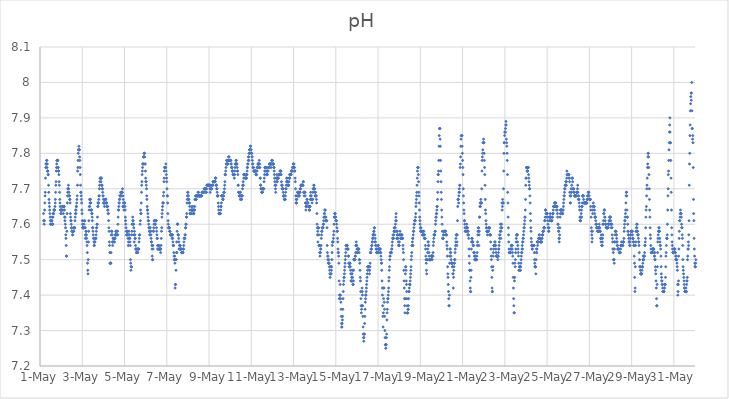
| Category | pH |
|---|---|
| 44682.166666666664 | 7.63 |
| 44682.177083333336 | 7.61 |
| 44682.1875 | 7.61 |
| 44682.197916666664 | 7.6 |
| 44682.208333333336 | 7.61 |
| 44682.21875 | 7.64 |
| 44682.229166666664 | 7.66 |
| 44682.239583333336 | 7.68 |
| 44682.25 | 7.69 |
| 44682.260416666664 | 7.73 |
| 44682.270833333336 | 7.76 |
| 44682.28125 | 7.77 |
| 44682.291666666664 | 7.77 |
| 44682.302083333336 | 7.77 |
| 44682.3125 | 7.78 |
| 44682.322916666664 | 7.78 |
| 44682.333333333336 | 7.76 |
| 44682.34375 | 7.77 |
| 44682.354166666664 | 7.75 |
| 44682.364583333336 | 7.75 |
| 44682.375 | 7.75 |
| 44682.385416666664 | 7.74 |
| 44682.395833333336 | 7.74 |
| 44682.40625 | 7.71 |
| 44682.416666666664 | 7.69 |
| 44682.427083333336 | 7.67 |
| 44682.4375 | 7.66 |
| 44682.447916666664 | 7.65 |
| 44682.458333333336 | 7.64 |
| 44682.46875 | 7.63 |
| 44682.479166666664 | 7.62 |
| 44682.489583333336 | 7.61 |
| 44682.5 | 7.6 |
| 44682.510416666664 | 7.6 |
| 44682.520833333336 | 7.6 |
| 44682.53125 | 7.61 |
| 44682.541666666664 | 7.61 |
| 44682.552083333336 | 7.61 |
| 44682.5625 | 7.61 |
| 44682.572916666664 | 7.62 |
| 44682.583333333336 | 7.6 |
| 44682.59375 | 7.6 |
| 44682.604166666664 | 7.6 |
| 44682.614583333336 | 7.62 |
| 44682.625 | 7.63 |
| 44682.635416666664 | 7.63 |
| 44682.645833333336 | 7.63 |
| 44682.65625 | 7.64 |
| 44682.666666666664 | 7.64 |
| 44682.677083333336 | 7.64 |
| 44682.6875 | 7.64 |
| 44682.697916666664 | 7.64 |
| 44682.708333333336 | 7.65 |
| 44682.71875 | 7.66 |
| 44682.729166666664 | 7.67 |
| 44682.739583333336 | 7.69 |
| 44682.75 | 7.71 |
| 44682.760416666664 | 7.72 |
| 44682.770833333336 | 7.75 |
| 44682.78125 | 7.76 |
| 44682.791666666664 | 7.77 |
| 44682.802083333336 | 7.78 |
| 44682.8125 | 7.78 |
| 44682.822916666664 | 7.78 |
| 44682.833333333336 | 7.78 |
| 44682.84375 | 7.78 |
| 44682.854166666664 | 7.76 |
| 44682.864583333336 | 7.76 |
| 44682.875 | 7.75 |
| 44682.885416666664 | 7.75 |
| 44682.895833333336 | 7.74 |
| 44682.90625 | 7.72 |
| 44682.916666666664 | 7.71 |
| 44682.927083333336 | 7.69 |
| 44682.9375 | 7.67 |
| 44682.947916666664 | 7.66 |
| 44682.958333333336 | 7.65 |
| 44682.96875 | 7.64 |
| 44682.979166666664 | 7.64 |
| 44682.989583333336 | 7.63 |
| 44683.0 | 7.63 |
| 44683.010416666664 | 7.64 |
| 44683.020833333336 | 7.64 |
| 44683.03125 | 7.64 |
| 44683.041666666664 | 7.64 |
| 44683.052083333336 | 7.65 |
| 44683.0625 | 7.65 |
| 44683.072916666664 | 7.65 |
| 44683.083333333336 | 7.65 |
| 44683.09375 | 7.64 |
| 44683.104166666664 | 7.63 |
| 44683.114583333336 | 7.65 |
| 44683.125 | 7.65 |
| 44683.135416666664 | 7.65 |
| 44683.145833333336 | 7.65 |
| 44683.15625 | 7.64 |
| 44683.166666666664 | 7.62 |
| 44683.177083333336 | 7.61 |
| 44683.1875 | 7.62 |
| 44683.197916666664 | 7.6 |
| 44683.208333333336 | 7.59 |
| 44683.21875 | 7.57 |
| 44683.229166666664 | 7.56 |
| 44683.239583333336 | 7.54 |
| 44683.25 | 7.51 |
| 44683.260416666664 | 7.51 |
| 44683.270833333336 | 7.58 |
| 44683.28125 | 7.63 |
| 44683.291666666664 | 7.66 |
| 44683.302083333336 | 7.68 |
| 44683.3125 | 7.69 |
| 44683.322916666664 | 7.7 |
| 44683.333333333336 | 7.7 |
| 44683.34375 | 7.71 |
| 44683.354166666664 | 7.7 |
| 44683.364583333336 | 7.68 |
| 44683.375 | 7.69 |
| 44683.385416666664 | 7.68 |
| 44683.395833333336 | 7.68 |
| 44683.40625 | 7.67 |
| 44683.416666666664 | 7.67 |
| 44683.427083333336 | 7.66 |
| 44683.4375 | 7.63 |
| 44683.447916666664 | 7.62 |
| 44683.458333333336 | 7.61 |
| 44683.46875 | 7.61 |
| 44683.479166666664 | 7.6 |
| 44683.489583333336 | 7.59 |
| 44683.5 | 7.59 |
| 44683.510416666664 | 7.58 |
| 44683.520833333336 | 7.58 |
| 44683.53125 | 7.58 |
| 44683.541666666664 | 7.57 |
| 44683.552083333336 | 7.57 |
| 44683.5625 | 7.58 |
| 44683.572916666664 | 7.58 |
| 44683.583333333336 | 7.58 |
| 44683.59375 | 7.58 |
| 44683.604166666664 | 7.59 |
| 44683.614583333336 | 7.59 |
| 44683.625 | 7.59 |
| 44683.635416666664 | 7.59 |
| 44683.645833333336 | 7.59 |
| 44683.65625 | 7.61 |
| 44683.666666666664 | 7.62 |
| 44683.677083333336 | 7.63 |
| 44683.6875 | 7.64 |
| 44683.697916666664 | 7.63 |
| 44683.708333333336 | 7.64 |
| 44683.71875 | 7.65 |
| 44683.729166666664 | 7.65 |
| 44683.739583333336 | 7.66 |
| 44683.75 | 7.67 |
| 44683.760416666664 | 7.68 |
| 44683.770833333336 | 7.71 |
| 44683.78125 | 7.75 |
| 44683.791666666664 | 7.76 |
| 44683.802083333336 | 7.78 |
| 44683.8125 | 7.8 |
| 44683.822916666664 | 7.81 |
| 44683.833333333336 | 7.81 |
| 44683.84375 | 7.82 |
| 44683.854166666664 | 7.81 |
| 44683.864583333336 | 7.81 |
| 44683.875 | 7.79 |
| 44683.885416666664 | 7.78 |
| 44683.895833333336 | 7.76 |
| 44683.90625 | 7.74 |
| 44683.916666666664 | 7.71 |
| 44683.927083333336 | 7.69 |
| 44683.9375 | 7.69 |
| 44683.947916666664 | 7.68 |
| 44683.958333333336 | 7.67 |
| 44683.96875 | 7.66 |
| 44683.979166666664 | 7.64 |
| 44683.989583333336 | 7.63 |
| 44684.0 | 7.61 |
| 44684.010416666664 | 7.6 |
| 44684.020833333336 | 7.59 |
| 44684.03125 | 7.59 |
| 44684.041666666664 | 7.59 |
| 44684.052083333336 | 7.59 |
| 44684.0625 | 7.59 |
| 44684.072916666664 | 7.59 |
| 44684.083333333336 | 7.6 |
| 44684.09375 | 7.61 |
| 44684.104166666664 | 7.61 |
| 44684.114583333336 | 7.61 |
| 44684.125 | 7.59 |
| 44684.135416666664 | 7.59 |
| 44684.145833333336 | 7.56 |
| 44684.15625 | 7.57 |
| 44684.166666666664 | 7.57 |
| 44684.177083333336 | 7.58 |
| 44684.1875 | 7.58 |
| 44684.197916666664 | 7.57 |
| 44684.208333333336 | 7.56 |
| 44684.21875 | 7.55 |
| 44684.229166666664 | 7.54 |
| 44684.239583333336 | 7.52 |
| 44684.25 | 7.49 |
| 44684.260416666664 | 7.47 |
| 44684.270833333336 | 7.46 |
| 44684.28125 | 7.5 |
| 44684.291666666664 | 7.55 |
| 44684.302083333336 | 7.58 |
| 44684.3125 | 7.61 |
| 44684.322916666664 | 7.64 |
| 44684.333333333336 | 7.65 |
| 44684.34375 | 7.67 |
| 44684.354166666664 | 7.65 |
| 44684.364583333336 | 7.66 |
| 44684.375 | 7.67 |
| 44684.385416666664 | 7.67 |
| 44684.395833333336 | 7.66 |
| 44684.40625 | 7.66 |
| 44684.416666666664 | 7.64 |
| 44684.427083333336 | 7.64 |
| 44684.4375 | 7.64 |
| 44684.447916666664 | 7.63 |
| 44684.458333333336 | 7.63 |
| 44684.46875 | 7.62 |
| 44684.479166666664 | 7.61 |
| 44684.489583333336 | 7.59 |
| 44684.5 | 7.59 |
| 44684.510416666664 | 7.58 |
| 44684.520833333336 | 7.57 |
| 44684.53125 | 7.56 |
| 44684.541666666664 | 7.56 |
| 44684.552083333336 | 7.55 |
| 44684.5625 | 7.54 |
| 44684.572916666664 | 7.54 |
| 44684.583333333336 | 7.55 |
| 44684.59375 | 7.55 |
| 44684.604166666664 | 7.55 |
| 44684.614583333336 | 7.56 |
| 44684.625 | 7.56 |
| 44684.635416666664 | 7.56 |
| 44684.645833333336 | 7.56 |
| 44684.65625 | 7.57 |
| 44684.666666666664 | 7.58 |
| 44684.677083333336 | 7.59 |
| 44684.6875 | 7.59 |
| 44684.697916666664 | 7.6 |
| 44684.708333333336 | 7.6 |
| 44684.71875 | 7.62 |
| 44684.729166666664 | 7.65 |
| 44684.739583333336 | 7.66 |
| 44684.75 | 7.65 |
| 44684.760416666664 | 7.66 |
| 44684.770833333336 | 7.66 |
| 44684.78125 | 7.67 |
| 44684.791666666664 | 7.68 |
| 44684.802083333336 | 7.68 |
| 44684.8125 | 7.7 |
| 44684.822916666664 | 7.71 |
| 44684.833333333336 | 7.72 |
| 44684.84375 | 7.73 |
| 44684.854166666664 | 7.73 |
| 44684.864583333336 | 7.73 |
| 44684.875 | 7.73 |
| 44684.885416666664 | 7.72 |
| 44684.895833333336 | 7.73 |
| 44684.90625 | 7.73 |
| 44684.916666666664 | 7.71 |
| 44684.927083333336 | 7.71 |
| 44684.9375 | 7.71 |
| 44684.947916666664 | 7.7 |
| 44684.958333333336 | 7.7 |
| 44684.96875 | 7.69 |
| 44684.979166666664 | 7.68 |
| 44684.989583333336 | 7.68 |
| 44685.0 | 7.67 |
| 44685.010416666664 | 7.66 |
| 44685.020833333336 | 7.66 |
| 44685.03125 | 7.66 |
| 44685.041666666664 | 7.66 |
| 44685.052083333336 | 7.65 |
| 44685.0625 | 7.66 |
| 44685.072916666664 | 7.67 |
| 44685.083333333336 | 7.67 |
| 44685.09375 | 7.67 |
| 44685.104166666664 | 7.67 |
| 44685.114583333336 | 7.67 |
| 44685.125 | 7.66 |
| 44685.135416666664 | 7.66 |
| 44685.145833333336 | 7.66 |
| 44685.15625 | 7.66 |
| 44685.166666666664 | 7.65 |
| 44685.177083333336 | 7.65 |
| 44685.1875 | 7.65 |
| 44685.197916666664 | 7.65 |
| 44685.208333333336 | 7.64 |
| 44685.21875 | 7.64 |
| 44685.229166666664 | 7.63 |
| 44685.239583333336 | 7.63 |
| 44685.25 | 7.61 |
| 44685.260416666664 | 7.59 |
| 44685.270833333336 | 7.58 |
| 44685.28125 | 7.55 |
| 44685.291666666664 | 7.54 |
| 44685.302083333336 | 7.52 |
| 44685.3125 | 7.49 |
| 44685.322916666664 | 7.49 |
| 44685.333333333336 | 7.49 |
| 44685.34375 | 7.49 |
| 44685.354166666664 | 7.49 |
| 44685.364583333336 | 7.52 |
| 44685.375 | 7.57 |
| 44685.385416666664 | 7.58 |
| 44685.395833333336 | 7.58 |
| 44685.40625 | 7.58 |
| 44685.416666666664 | 7.57 |
| 44685.427083333336 | 7.55 |
| 44685.4375 | 7.54 |
| 44685.447916666664 | 7.55 |
| 44685.458333333336 | 7.56 |
| 44685.46875 | 7.56 |
| 44685.479166666664 | 7.56 |
| 44685.489583333336 | 7.55 |
| 44685.5 | 7.56 |
| 44685.510416666664 | 7.55 |
| 44685.520833333336 | 7.55 |
| 44685.53125 | 7.56 |
| 44685.541666666664 | 7.56 |
| 44685.552083333336 | 7.56 |
| 44685.5625 | 7.57 |
| 44685.572916666664 | 7.57 |
| 44685.583333333336 | 7.57 |
| 44685.59375 | 7.58 |
| 44685.604166666664 | 7.58 |
| 44685.614583333336 | 7.58 |
| 44685.625 | 7.57 |
| 44685.635416666664 | 7.57 |
| 44685.645833333336 | 7.57 |
| 44685.65625 | 7.58 |
| 44685.666666666664 | 7.58 |
| 44685.677083333336 | 7.57 |
| 44685.6875 | 7.6 |
| 44685.697916666664 | 7.62 |
| 44685.708333333336 | 7.64 |
| 44685.71875 | 7.64 |
| 44685.729166666664 | 7.65 |
| 44685.739583333336 | 7.66 |
| 44685.75 | 7.66 |
| 44685.760416666664 | 7.67 |
| 44685.770833333336 | 7.67 |
| 44685.78125 | 7.68 |
| 44685.791666666664 | 7.68 |
| 44685.802083333336 | 7.68 |
| 44685.8125 | 7.69 |
| 44685.822916666664 | 7.68 |
| 44685.833333333336 | 7.68 |
| 44685.84375 | 7.69 |
| 44685.854166666664 | 7.68 |
| 44685.864583333336 | 7.69 |
| 44685.875 | 7.69 |
| 44685.885416666664 | 7.69 |
| 44685.895833333336 | 7.69 |
| 44685.90625 | 7.7 |
| 44685.916666666664 | 7.65 |
| 44685.927083333336 | 7.68 |
| 44685.9375 | 7.67 |
| 44685.947916666664 | 7.66 |
| 44685.958333333336 | 7.65 |
| 44685.96875 | 7.64 |
| 44685.979166666664 | 7.66 |
| 44685.989583333336 | 7.66 |
| 44686.0 | 7.66 |
| 44686.010416666664 | 7.66 |
| 44686.020833333336 | 7.65 |
| 44686.03125 | 7.64 |
| 44686.041666666664 | 7.62 |
| 44686.052083333336 | 7.61 |
| 44686.0625 | 7.6 |
| 44686.072916666664 | 7.59 |
| 44686.083333333336 | 7.58 |
| 44686.09375 | 7.57 |
| 44686.104166666664 | 7.58 |
| 44686.114583333336 | 7.57 |
| 44686.125 | 7.58 |
| 44686.135416666664 | 7.58 |
| 44686.145833333336 | 7.57 |
| 44686.15625 | 7.57 |
| 44686.166666666664 | 7.56 |
| 44686.177083333336 | 7.54 |
| 44686.1875 | 7.55 |
| 44686.197916666664 | 7.57 |
| 44686.208333333336 | 7.58 |
| 44686.21875 | 7.56 |
| 44686.229166666664 | 7.57 |
| 44686.239583333336 | 7.56 |
| 44686.25 | 7.56 |
| 44686.260416666664 | 7.55 |
| 44686.270833333336 | 7.54 |
| 44686.28125 | 7.5 |
| 44686.291666666664 | 7.49 |
| 44686.302083333336 | 7.47 |
| 44686.3125 | 7.48 |
| 44686.322916666664 | 7.48 |
| 44686.333333333336 | 7.48 |
| 44686.34375 | 7.57 |
| 44686.354166666664 | 7.58 |
| 44686.364583333336 | 7.6 |
| 44686.375 | 7.6 |
| 44686.385416666664 | 7.62 |
| 44686.395833333336 | 7.61 |
| 44686.40625 | 7.61 |
| 44686.416666666664 | 7.6 |
| 44686.427083333336 | 7.6 |
| 44686.4375 | 7.59 |
| 44686.447916666664 | 7.57 |
| 44686.458333333336 | 7.55 |
| 44686.46875 | 7.58 |
| 44686.479166666664 | 7.57 |
| 44686.489583333336 | 7.57 |
| 44686.5 | 7.56 |
| 44686.510416666664 | 7.56 |
| 44686.520833333336 | 7.54 |
| 44686.53125 | 7.53 |
| 44686.541666666664 | 7.53 |
| 44686.552083333336 | 7.53 |
| 44686.5625 | 7.52 |
| 44686.572916666664 | 7.52 |
| 44686.583333333336 | 7.53 |
| 44686.59375 | 7.53 |
| 44686.604166666664 | 7.52 |
| 44686.614583333336 | 7.52 |
| 44686.625 | 7.52 |
| 44686.635416666664 | 7.53 |
| 44686.645833333336 | 7.53 |
| 44686.65625 | 7.53 |
| 44686.666666666664 | 7.53 |
| 44686.677083333336 | 7.53 |
| 44686.6875 | 7.55 |
| 44686.697916666664 | 7.56 |
| 44686.708333333336 | 7.57 |
| 44686.71875 | 7.57 |
| 44686.739583333336 | 7.6 |
| 44686.75 | 7.61 |
| 44686.760416666664 | 7.64 |
| 44686.770833333336 | 7.63 |
| 44686.78125 | 7.63 |
| 44686.791666666664 | 7.66 |
| 44686.802083333336 | 7.69 |
| 44686.8125 | 7.71 |
| 44686.822916666664 | 7.72 |
| 44686.833333333336 | 7.74 |
| 44686.84375 | 7.75 |
| 44686.854166666664 | 7.76 |
| 44686.864583333336 | 7.77 |
| 44686.875 | 7.77 |
| 44686.885416666664 | 7.77 |
| 44686.895833333336 | 7.79 |
| 44686.90625 | 7.79 |
| 44686.916666666664 | 7.79 |
| 44686.927083333336 | 7.8 |
| 44686.9375 | 7.8 |
| 44686.947916666664 | 7.8 |
| 44686.958333333336 | 7.79 |
| 44686.96875 | 7.77 |
| 44686.979166666664 | 7.77 |
| 44686.989583333336 | 7.75 |
| 44687.0 | 7.73 |
| 44687.010416666664 | 7.72 |
| 44687.020833333336 | 7.72 |
| 44687.03125 | 7.71 |
| 44687.041666666664 | 7.7 |
| 44687.052083333336 | 7.68 |
| 44687.0625 | 7.67 |
| 44687.072916666664 | 7.65 |
| 44687.083333333336 | 7.64 |
| 44687.09375 | 7.64 |
| 44687.104166666664 | 7.63 |
| 44687.114583333336 | 7.62 |
| 44687.125 | 7.61 |
| 44687.135416666664 | 7.61 |
| 44687.145833333336 | 7.6 |
| 44687.15625 | 7.59 |
| 44687.166666666664 | 7.59 |
| 44687.177083333336 | 7.58 |
| 44687.1875 | 7.58 |
| 44687.197916666664 | 7.57 |
| 44687.208333333336 | 7.57 |
| 44687.21875 | 7.59 |
| 44687.229166666664 | 7.58 |
| 44687.239583333336 | 7.58 |
| 44687.25 | 7.57 |
| 44687.260416666664 | 7.56 |
| 44687.270833333336 | 7.55 |
| 44687.28125 | 7.55 |
| 44687.291666666664 | 7.54 |
| 44687.302083333336 | 7.53 |
| 44687.3125 | 7.51 |
| 44687.322916666664 | 7.5 |
| 44687.333333333336 | 7.5 |
| 44687.34375 | 7.54 |
| 44687.354166666664 | 7.53 |
| 44687.364583333336 | 7.58 |
| 44687.375 | 7.58 |
| 44687.385416666664 | 7.59 |
| 44687.395833333336 | 7.6 |
| 44687.40625 | 7.61 |
| 44687.416666666664 | 7.61 |
| 44687.427083333336 | 7.61 |
| 44687.4375 | 7.61 |
| 44687.447916666664 | 7.6 |
| 44687.458333333336 | 7.6 |
| 44687.46875 | 7.61 |
| 44687.479166666664 | 7.61 |
| 44687.489583333336 | 7.61 |
| 44687.5 | 7.61 |
| 44687.510416666664 | 7.59 |
| 44687.520833333336 | 7.58 |
| 44687.53125 | 7.57 |
| 44687.541666666664 | 7.56 |
| 44687.552083333336 | 7.56 |
| 44687.5625 | 7.54 |
| 44687.572916666664 | 7.53 |
| 44687.583333333336 | 7.53 |
| 44687.59375 | 7.53 |
| 44687.604166666664 | 7.54 |
| 44687.614583333336 | 7.54 |
| 44687.625 | 7.54 |
| 44687.635416666664 | 7.53 |
| 44687.645833333336 | 7.53 |
| 44687.65625 | 7.53 |
| 44687.666666666664 | 7.53 |
| 44687.677083333336 | 7.53 |
| 44687.6875 | 7.53 |
| 44687.697916666664 | 7.53 |
| 44687.708333333336 | 7.52 |
| 44687.71875 | 7.53 |
| 44687.729166666664 | 7.54 |
| 44687.739583333336 | 7.56 |
| 44687.75 | 7.58 |
| 44687.760416666664 | 7.59 |
| 44687.770833333336 | 7.62 |
| 44687.78125 | 7.63 |
| 44687.791666666664 | 7.64 |
| 44687.802083333336 | 7.65 |
| 44687.8125 | 7.66 |
| 44687.822916666664 | 7.66 |
| 44687.833333333336 | 7.66 |
| 44687.84375 | 7.68 |
| 44687.854166666664 | 7.69 |
| 44687.864583333336 | 7.72 |
| 44687.875 | 7.73 |
| 44687.885416666664 | 7.75 |
| 44687.895833333336 | 7.76 |
| 44687.90625 | 7.76 |
| 44687.916666666664 | 7.76 |
| 44687.927083333336 | 7.76 |
| 44687.9375 | 7.76 |
| 44687.947916666664 | 7.76 |
| 44687.958333333336 | 7.77 |
| 44687.96875 | 7.75 |
| 44687.979166666664 | 7.74 |
| 44687.989583333336 | 7.73 |
| 44688.0 | 7.72 |
| 44688.010416666664 | 7.7 |
| 44688.020833333336 | 7.68 |
| 44688.03125 | 7.68 |
| 44688.041666666664 | 7.66 |
| 44688.052083333336 | 7.63 |
| 44688.0625 | 7.61 |
| 44688.072916666664 | 7.6 |
| 44688.083333333336 | 7.59 |
| 44688.09375 | 7.59 |
| 44688.104166666664 | 7.59 |
| 44688.114583333336 | 7.59 |
| 44688.125 | 7.59 |
| 44688.135416666664 | 7.58 |
| 44688.145833333336 | 7.58 |
| 44688.15625 | 7.58 |
| 44688.166666666664 | 7.57 |
| 44688.177083333336 | 7.57 |
| 44688.1875 | 7.57 |
| 44688.197916666664 | 7.57 |
| 44688.208333333336 | 7.57 |
| 44688.21875 | 7.57 |
| 44688.229166666664 | 7.57 |
| 44688.239583333336 | 7.57 |
| 44688.25 | 7.56 |
| 44688.260416666664 | 7.57 |
| 44688.270833333336 | 7.57 |
| 44688.28125 | 7.56 |
| 44688.291666666664 | 7.55 |
| 44688.302083333336 | 7.54 |
| 44688.3125 | 7.54 |
| 44688.322916666664 | 7.54 |
| 44688.333333333336 | 7.52 |
| 44688.34375 | 7.51 |
| 44688.354166666664 | 7.5 |
| 44688.364583333336 | 7.5 |
| 44688.375 | 7.51 |
| 44688.385416666664 | 7.49 |
| 44688.395833333336 | 7.42 |
| 44688.40625 | 7.43 |
| 44688.416666666664 | 7.43 |
| 44688.427083333336 | 7.5 |
| 44688.4375 | 7.47 |
| 44688.447916666664 | 7.5 |
| 44688.458333333336 | 7.52 |
| 44688.46875 | 7.55 |
| 44688.479166666664 | 7.52 |
| 44688.489583333336 | 7.58 |
| 44688.5 | 7.6 |
| 44688.510416666664 | 7.6 |
| 44688.520833333336 | 7.6 |
| 44688.53125 | 7.57 |
| 44688.541666666664 | 7.57 |
| 44688.552083333336 | 7.57 |
| 44688.5625 | 7.56 |
| 44688.572916666664 | 7.55 |
| 44688.583333333336 | 7.53 |
| 44688.59375 | 7.53 |
| 44688.604166666664 | 7.54 |
| 44688.614583333336 | 7.54 |
| 44688.625 | 7.54 |
| 44688.635416666664 | 7.54 |
| 44688.645833333336 | 7.53 |
| 44688.65625 | 7.53 |
| 44688.666666666664 | 7.53 |
| 44688.677083333336 | 7.53 |
| 44688.6875 | 7.53 |
| 44688.697916666664 | 7.52 |
| 44688.708333333336 | 7.52 |
| 44688.71875 | 7.52 |
| 44688.729166666664 | 7.52 |
| 44688.739583333336 | 7.52 |
| 44688.75 | 7.52 |
| 44688.760416666664 | 7.52 |
| 44688.770833333336 | 7.52 |
| 44688.78125 | 7.53 |
| 44688.791666666664 | 7.53 |
| 44688.802083333336 | 7.54 |
| 44688.8125 | 7.55 |
| 44688.822916666664 | 7.56 |
| 44688.833333333336 | 7.56 |
| 44688.84375 | 7.56 |
| 44688.854166666664 | 7.56 |
| 44688.864583333336 | 7.57 |
| 44688.875 | 7.57 |
| 44688.885416666664 | 7.59 |
| 44688.895833333336 | 7.59 |
| 44688.90625 | 7.6 |
| 44688.916666666664 | 7.6 |
| 44688.927083333336 | 7.62 |
| 44688.9375 | 7.62 |
| 44688.947916666664 | 7.63 |
| 44688.958333333336 | 7.66 |
| 44688.96875 | 7.67 |
| 44688.979166666664 | 7.68 |
| 44688.989583333336 | 7.69 |
| 44689.0 | 7.69 |
| 44689.010416666664 | 7.68 |
| 44689.020833333336 | 7.68 |
| 44689.03125 | 7.67 |
| 44689.041666666664 | 7.67 |
| 44689.052083333336 | 7.66 |
| 44689.0625 | 7.66 |
| 44689.072916666664 | 7.66 |
| 44689.083333333336 | 7.65 |
| 44689.09375 | 7.64 |
| 44689.104166666664 | 7.63 |
| 44689.114583333336 | 7.63 |
| 44689.125 | 7.63 |
| 44689.135416666664 | 7.63 |
| 44689.145833333336 | 7.63 |
| 44689.15625 | 7.64 |
| 44689.166666666664 | 7.64 |
| 44689.177083333336 | 7.65 |
| 44689.1875 | 7.64 |
| 44689.197916666664 | 7.64 |
| 44689.208333333336 | 7.64 |
| 44689.21875 | 7.64 |
| 44689.229166666664 | 7.65 |
| 44689.239583333336 | 7.64 |
| 44689.25 | 7.63 |
| 44689.260416666664 | 7.64 |
| 44689.270833333336 | 7.63 |
| 44689.28125 | 7.63 |
| 44689.291666666664 | 7.64 |
| 44689.302083333336 | 7.64 |
| 44689.3125 | 7.64 |
| 44689.322916666664 | 7.65 |
| 44689.333333333336 | 7.67 |
| 44689.34375 | 7.67 |
| 44689.354166666664 | 7.68 |
| 44689.364583333336 | 7.67 |
| 44689.375 | 7.67 |
| 44689.385416666664 | 7.68 |
| 44689.395833333336 | 7.67 |
| 44689.40625 | 7.68 |
| 44689.416666666664 | 7.68 |
| 44689.427083333336 | 7.68 |
| 44689.4375 | 7.68 |
| 44689.447916666664 | 7.68 |
| 44689.458333333336 | 7.68 |
| 44689.46875 | 7.68 |
| 44689.479166666664 | 7.69 |
| 44689.489583333336 | 7.68 |
| 44689.5 | 7.69 |
| 44689.510416666664 | 7.68 |
| 44689.520833333336 | 7.68 |
| 44689.53125 | 7.68 |
| 44689.541666666664 | 7.68 |
| 44689.552083333336 | 7.68 |
| 44689.5625 | 7.68 |
| 44689.572916666664 | 7.68 |
| 44689.583333333336 | 7.68 |
| 44689.59375 | 7.68 |
| 44689.604166666664 | 7.68 |
| 44689.614583333336 | 7.68 |
| 44689.625 | 7.68 |
| 44689.635416666664 | 7.68 |
| 44689.645833333336 | 7.68 |
| 44689.65625 | 7.68 |
| 44689.666666666664 | 7.69 |
| 44689.677083333336 | 7.69 |
| 44689.6875 | 7.69 |
| 44689.697916666664 | 7.69 |
| 44689.708333333336 | 7.69 |
| 44689.71875 | 7.69 |
| 44689.729166666664 | 7.69 |
| 44689.739583333336 | 7.69 |
| 44689.75 | 7.69 |
| 44689.760416666664 | 7.69 |
| 44689.770833333336 | 7.7 |
| 44689.78125 | 7.7 |
| 44689.791666666664 | 7.7 |
| 44689.802083333336 | 7.7 |
| 44689.8125 | 7.7 |
| 44689.822916666664 | 7.7 |
| 44689.833333333336 | 7.7 |
| 44689.84375 | 7.7 |
| 44689.854166666664 | 7.7 |
| 44689.864583333336 | 7.69 |
| 44689.875 | 7.69 |
| 44689.885416666664 | 7.7 |
| 44689.895833333336 | 7.71 |
| 44689.90625 | 7.71 |
| 44689.916666666664 | 7.71 |
| 44689.927083333336 | 7.71 |
| 44689.9375 | 7.71 |
| 44689.947916666664 | 7.71 |
| 44689.958333333336 | 7.71 |
| 44689.96875 | 7.71 |
| 44689.979166666664 | 7.71 |
| 44689.989583333336 | 7.71 |
| 44690.0 | 7.71 |
| 44690.010416666664 | 7.71 |
| 44690.020833333336 | 7.71 |
| 44690.03125 | 7.71 |
| 44690.041666666664 | 7.7 |
| 44690.052083333336 | 7.69 |
| 44690.0625 | 7.7 |
| 44690.072916666664 | 7.71 |
| 44690.083333333336 | 7.7 |
| 44690.09375 | 7.7 |
| 44690.104166666664 | 7.7 |
| 44690.114583333336 | 7.7 |
| 44690.125 | 7.7 |
| 44690.135416666664 | 7.71 |
| 44690.145833333336 | 7.71 |
| 44690.15625 | 7.71 |
| 44690.166666666664 | 7.71 |
| 44690.177083333336 | 7.71 |
| 44690.1875 | 7.72 |
| 44690.197916666664 | 7.72 |
| 44690.208333333336 | 7.72 |
| 44690.21875 | 7.72 |
| 44690.229166666664 | 7.72 |
| 44690.239583333336 | 7.72 |
| 44690.25 | 7.72 |
| 44690.260416666664 | 7.72 |
| 44690.270833333336 | 7.72 |
| 44690.28125 | 7.72 |
| 44690.291666666664 | 7.72 |
| 44690.302083333336 | 7.73 |
| 44690.3125 | 7.73 |
| 44690.322916666664 | 7.73 |
| 44690.333333333336 | 7.71 |
| 44690.34375 | 7.71 |
| 44690.354166666664 | 7.71 |
| 44690.364583333336 | 7.7 |
| 44690.375 | 7.7 |
| 44690.385416666664 | 7.69 |
| 44690.395833333336 | 7.68 |
| 44690.40625 | 7.68 |
| 44690.416666666664 | 7.68 |
| 44690.427083333336 | 7.68 |
| 44690.4375 | 7.66 |
| 44690.447916666664 | 7.65 |
| 44690.458333333336 | 7.64 |
| 44690.46875 | 7.63 |
| 44690.479166666664 | 7.63 |
| 44690.489583333336 | 7.63 |
| 44690.5 | 7.63 |
| 44690.510416666664 | 7.63 |
| 44690.520833333336 | 7.63 |
| 44690.53125 | 7.63 |
| 44690.541666666664 | 7.63 |
| 44690.552083333336 | 7.64 |
| 44690.5625 | 7.65 |
| 44690.572916666664 | 7.65 |
| 44690.583333333336 | 7.66 |
| 44690.59375 | 7.68 |
| 44690.604166666664 | 7.68 |
| 44690.614583333336 | 7.68 |
| 44690.625 | 7.68 |
| 44690.635416666664 | 7.68 |
| 44690.645833333336 | 7.67 |
| 44690.65625 | 7.67 |
| 44690.666666666664 | 7.67 |
| 44690.677083333336 | 7.68 |
| 44690.6875 | 7.68 |
| 44690.697916666664 | 7.69 |
| 44690.708333333336 | 7.69 |
| 44690.71875 | 7.69 |
| 44690.729166666664 | 7.7 |
| 44690.739583333336 | 7.71 |
| 44690.75 | 7.72 |
| 44690.760416666664 | 7.74 |
| 44690.770833333336 | 7.74 |
| 44690.78125 | 7.74 |
| 44690.791666666664 | 7.75 |
| 44690.802083333336 | 7.76 |
| 44690.8125 | 7.77 |
| 44690.822916666664 | 7.77 |
| 44690.833333333336 | 7.78 |
| 44690.84375 | 7.78 |
| 44690.854166666664 | 7.78 |
| 44690.864583333336 | 7.77 |
| 44690.875 | 7.77 |
| 44690.885416666664 | 7.77 |
| 44690.895833333336 | 7.77 |
| 44690.90625 | 7.78 |
| 44690.916666666664 | 7.78 |
| 44690.927083333336 | 7.79 |
| 44690.9375 | 7.79 |
| 44690.947916666664 | 7.79 |
| 44690.958333333336 | 7.78 |
| 44690.96875 | 7.78 |
| 44690.979166666664 | 7.78 |
| 44690.989583333336 | 7.78 |
| 44691.0 | 7.78 |
| 44691.010416666664 | 7.78 |
| 44691.020833333336 | 7.78 |
| 44691.03125 | 7.78 |
| 44691.041666666664 | 7.77 |
| 44691.052083333336 | 7.77 |
| 44691.0625 | 7.76 |
| 44691.072916666664 | 7.76 |
| 44691.083333333336 | 7.76 |
| 44691.09375 | 7.75 |
| 44691.104166666664 | 7.75 |
| 44691.114583333336 | 7.75 |
| 44691.125 | 7.75 |
| 44691.135416666664 | 7.74 |
| 44691.145833333336 | 7.74 |
| 44691.15625 | 7.74 |
| 44691.166666666664 | 7.74 |
| 44691.177083333336 | 7.74 |
| 44691.1875 | 7.74 |
| 44691.197916666664 | 7.73 |
| 44691.208333333336 | 7.74 |
| 44691.21875 | 7.75 |
| 44691.229166666664 | 7.76 |
| 44691.239583333336 | 7.77 |
| 44691.25 | 7.77 |
| 44691.260416666664 | 7.77 |
| 44691.270833333336 | 7.77 |
| 44691.28125 | 7.78 |
| 44691.291666666664 | 7.78 |
| 44691.302083333336 | 7.77 |
| 44691.3125 | 7.77 |
| 44691.322916666664 | 7.77 |
| 44691.333333333336 | 7.76 |
| 44691.34375 | 7.75 |
| 44691.354166666664 | 7.75 |
| 44691.364583333336 | 7.74 |
| 44691.375 | 7.71 |
| 44691.385416666664 | 7.71 |
| 44691.395833333336 | 7.69 |
| 44691.40625 | 7.69 |
| 44691.416666666664 | 7.69 |
| 44691.427083333336 | 7.68 |
| 44691.4375 | 7.68 |
| 44691.447916666664 | 7.68 |
| 44691.458333333336 | 7.68 |
| 44691.46875 | 7.69 |
| 44691.479166666664 | 7.67 |
| 44691.489583333336 | 7.69 |
| 44691.5 | 7.68 |
| 44691.510416666664 | 7.68 |
| 44691.520833333336 | 7.68 |
| 44691.53125 | 7.67 |
| 44691.541666666664 | 7.67 |
| 44691.552083333336 | 7.68 |
| 44691.5625 | 7.68 |
| 44691.572916666664 | 7.68 |
| 44691.583333333336 | 7.7 |
| 44691.59375 | 7.71 |
| 44691.604166666664 | 7.71 |
| 44691.614583333336 | 7.72 |
| 44691.625 | 7.71 |
| 44691.635416666664 | 7.74 |
| 44691.645833333336 | 7.73 |
| 44691.65625 | 7.74 |
| 44691.666666666664 | 7.74 |
| 44691.677083333336 | 7.74 |
| 44691.6875 | 7.74 |
| 44691.697916666664 | 7.74 |
| 44691.708333333336 | 7.73 |
| 44691.71875 | 7.73 |
| 44691.729166666664 | 7.73 |
| 44691.739583333336 | 7.73 |
| 44691.75 | 7.73 |
| 44691.760416666664 | 7.73 |
| 44691.770833333336 | 7.73 |
| 44691.78125 | 7.74 |
| 44691.791666666664 | 7.74 |
| 44691.802083333336 | 7.75 |
| 44691.8125 | 7.76 |
| 44691.822916666664 | 7.76 |
| 44691.833333333336 | 7.77 |
| 44691.84375 | 7.77 |
| 44691.854166666664 | 7.78 |
| 44691.864583333336 | 7.79 |
| 44691.875 | 7.79 |
| 44691.885416666664 | 7.78 |
| 44691.895833333336 | 7.8 |
| 44691.90625 | 7.8 |
| 44691.916666666664 | 7.81 |
| 44691.927083333336 | 7.81 |
| 44691.9375 | 7.81 |
| 44691.947916666664 | 7.81 |
| 44691.958333333336 | 7.82 |
| 44691.96875 | 7.82 |
| 44691.979166666664 | 7.81 |
| 44691.989583333336 | 7.81 |
| 44692.0 | 7.8 |
| 44692.010416666664 | 7.8 |
| 44692.020833333336 | 7.8 |
| 44692.03125 | 7.79 |
| 44692.041666666664 | 7.79 |
| 44692.052083333336 | 7.78 |
| 44692.0625 | 7.77 |
| 44692.072916666664 | 7.77 |
| 44692.083333333336 | 7.76 |
| 44692.09375 | 7.76 |
| 44692.104166666664 | 7.76 |
| 44692.114583333336 | 7.75 |
| 44692.125 | 7.75 |
| 44692.135416666664 | 7.75 |
| 44692.145833333336 | 7.75 |
| 44692.15625 | 7.75 |
| 44692.166666666664 | 7.75 |
| 44692.177083333336 | 7.75 |
| 44692.1875 | 7.75 |
| 44692.197916666664 | 7.75 |
| 44692.208333333336 | 7.75 |
| 44692.21875 | 7.74 |
| 44692.229166666664 | 7.74 |
| 44692.239583333336 | 7.74 |
| 44692.25 | 7.74 |
| 44692.260416666664 | 7.75 |
| 44692.270833333336 | 7.75 |
| 44692.28125 | 7.76 |
| 44692.291666666664 | 7.76 |
| 44692.302083333336 | 7.76 |
| 44692.3125 | 7.77 |
| 44692.322916666664 | 7.77 |
| 44692.333333333336 | 7.77 |
| 44692.34375 | 7.77 |
| 44692.354166666664 | 7.77 |
| 44692.364583333336 | 7.77 |
| 44692.375 | 7.78 |
| 44692.385416666664 | 7.76 |
| 44692.395833333336 | 7.77 |
| 44692.40625 | 7.76 |
| 44692.416666666664 | 7.73 |
| 44692.427083333336 | 7.73 |
| 44692.4375 | 7.71 |
| 44692.447916666664 | 7.71 |
| 44692.458333333336 | 7.7 |
| 44692.46875 | 7.7 |
| 44692.479166666664 | 7.7 |
| 44692.489583333336 | 7.69 |
| 44692.5 | 7.69 |
| 44692.510416666664 | 7.69 |
| 44692.520833333336 | 7.69 |
| 44692.53125 | 7.69 |
| 44692.541666666664 | 7.7 |
| 44692.552083333336 | 7.7 |
| 44692.5625 | 7.7 |
| 44692.572916666664 | 7.7 |
| 44692.583333333336 | 7.7 |
| 44692.59375 | 7.7 |
| 44692.604166666664 | 7.72 |
| 44692.614583333336 | 7.73 |
| 44692.625 | 7.74 |
| 44692.635416666664 | 7.75 |
| 44692.645833333336 | 7.76 |
| 44692.65625 | 7.76 |
| 44692.666666666664 | 7.76 |
| 44692.677083333336 | 7.76 |
| 44692.6875 | 7.75 |
| 44692.697916666664 | 7.76 |
| 44692.708333333336 | 7.75 |
| 44692.71875 | 7.74 |
| 44692.729166666664 | 7.74 |
| 44692.739583333336 | 7.74 |
| 44692.75 | 7.74 |
| 44692.760416666664 | 7.74 |
| 44692.770833333336 | 7.75 |
| 44692.78125 | 7.75 |
| 44692.791666666664 | 7.75 |
| 44692.802083333336 | 7.76 |
| 44692.8125 | 7.76 |
| 44692.822916666664 | 7.76 |
| 44692.833333333336 | 7.76 |
| 44692.84375 | 7.76 |
| 44692.854166666664 | 7.77 |
| 44692.864583333336 | 7.77 |
| 44692.875 | 7.77 |
| 44692.885416666664 | 7.77 |
| 44692.895833333336 | 7.77 |
| 44692.90625 | 7.77 |
| 44692.916666666664 | 7.77 |
| 44692.927083333336 | 7.77 |
| 44692.9375 | 7.76 |
| 44692.947916666664 | 7.77 |
| 44692.958333333336 | 7.77 |
| 44692.96875 | 7.78 |
| 44692.979166666664 | 7.78 |
| 44692.989583333336 | 7.78 |
| 44693.0 | 7.78 |
| 44693.010416666664 | 7.77 |
| 44693.020833333336 | 7.77 |
| 44693.03125 | 7.77 |
| 44693.041666666664 | 7.77 |
| 44693.052083333336 | 7.77 |
| 44693.0625 | 7.76 |
| 44693.072916666664 | 7.76 |
| 44693.083333333336 | 7.75 |
| 44693.09375 | 7.74 |
| 44693.104166666664 | 7.73 |
| 44693.114583333336 | 7.72 |
| 44693.125 | 7.71 |
| 44693.135416666664 | 7.71 |
| 44693.145833333336 | 7.7 |
| 44693.15625 | 7.69 |
| 44693.166666666664 | 7.71 |
| 44693.177083333336 | 7.73 |
| 44693.1875 | 7.73 |
| 44693.197916666664 | 7.72 |
| 44693.208333333336 | 7.74 |
| 44693.21875 | 7.73 |
| 44693.229166666664 | 7.72 |
| 44693.239583333336 | 7.73 |
| 44693.25 | 7.73 |
| 44693.260416666664 | 7.73 |
| 44693.270833333336 | 7.73 |
| 44693.28125 | 7.73 |
| 44693.291666666664 | 7.74 |
| 44693.302083333336 | 7.74 |
| 44693.3125 | 7.74 |
| 44693.322916666664 | 7.74 |
| 44693.333333333336 | 7.74 |
| 44693.34375 | 7.74 |
| 44693.354166666664 | 7.75 |
| 44693.364583333336 | 7.74 |
| 44693.375 | 7.75 |
| 44693.385416666664 | 7.75 |
| 44693.395833333336 | 7.75 |
| 44693.40625 | 7.75 |
| 44693.416666666664 | 7.74 |
| 44693.427083333336 | 7.72 |
| 44693.4375 | 7.71 |
| 44693.447916666664 | 7.71 |
| 44693.458333333336 | 7.7 |
| 44693.46875 | 7.71 |
| 44693.479166666664 | 7.7 |
| 44693.489583333336 | 7.7 |
| 44693.5 | 7.7 |
| 44693.510416666664 | 7.69 |
| 44693.520833333336 | 7.68 |
| 44693.53125 | 7.68 |
| 44693.541666666664 | 7.68 |
| 44693.552083333336 | 7.68 |
| 44693.5625 | 7.67 |
| 44693.572916666664 | 7.67 |
| 44693.583333333336 | 7.67 |
| 44693.59375 | 7.67 |
| 44693.604166666664 | 7.67 |
| 44693.614583333336 | 7.68 |
| 44693.625 | 7.69 |
| 44693.635416666664 | 7.7 |
| 44693.645833333336 | 7.7 |
| 44693.65625 | 7.71 |
| 44693.666666666664 | 7.72 |
| 44693.677083333336 | 7.73 |
| 44693.6875 | 7.73 |
| 44693.697916666664 | 7.72 |
| 44693.708333333336 | 7.72 |
| 44693.71875 | 7.72 |
| 44693.729166666664 | 7.71 |
| 44693.739583333336 | 7.71 |
| 44693.75 | 7.71 |
| 44693.760416666664 | 7.71 |
| 44693.770833333336 | 7.71 |
| 44693.78125 | 7.72 |
| 44693.791666666664 | 7.73 |
| 44693.802083333336 | 7.73 |
| 44693.8125 | 7.74 |
| 44693.822916666664 | 7.73 |
| 44693.833333333336 | 7.74 |
| 44693.84375 | 7.74 |
| 44693.854166666664 | 7.74 |
| 44693.864583333336 | 7.74 |
| 44693.875 | 7.74 |
| 44693.885416666664 | 7.74 |
| 44693.895833333336 | 7.75 |
| 44693.90625 | 7.75 |
| 44693.916666666664 | 7.75 |
| 44693.927083333336 | 7.75 |
| 44693.9375 | 7.75 |
| 44693.947916666664 | 7.76 |
| 44693.958333333336 | 7.76 |
| 44693.96875 | 7.76 |
| 44693.979166666664 | 7.76 |
| 44693.989583333336 | 7.77 |
| 44694.0 | 7.77 |
| 44694.010416666664 | 7.76 |
| 44694.020833333336 | 7.77 |
| 44694.03125 | 7.76 |
| 44694.041666666664 | 7.76 |
| 44694.052083333336 | 7.75 |
| 44694.0625 | 7.75 |
| 44694.072916666664 | 7.73 |
| 44694.083333333336 | 7.72 |
| 44694.09375 | 7.7 |
| 44694.104166666664 | 7.68 |
| 44694.114583333336 | 7.66 |
| 44694.125 | 7.67 |
| 44694.135416666664 | 7.66 |
| 44694.145833333336 | 7.66 |
| 44694.15625 | 7.67 |
| 44694.166666666664 | 7.68 |
| 44694.177083333336 | 7.68 |
| 44694.1875 | 7.69 |
| 44694.197916666664 | 7.69 |
| 44694.208333333336 | 7.69 |
| 44694.21875 | 7.69 |
| 44694.229166666664 | 7.69 |
| 44694.239583333336 | 7.68 |
| 44694.25 | 7.68 |
| 44694.260416666664 | 7.68 |
| 44694.270833333336 | 7.68 |
| 44694.28125 | 7.69 |
| 44694.291666666664 | 7.69 |
| 44694.302083333336 | 7.69 |
| 44694.3125 | 7.7 |
| 44694.322916666664 | 7.7 |
| 44694.333333333336 | 7.7 |
| 44694.34375 | 7.71 |
| 44694.354166666664 | 7.71 |
| 44694.364583333336 | 7.71 |
| 44694.375 | 7.71 |
| 44694.385416666664 | 7.71 |
| 44694.395833333336 | 7.71 |
| 44694.40625 | 7.71 |
| 44694.416666666664 | 7.71 |
| 44694.427083333336 | 7.71 |
| 44694.4375 | 7.71 |
| 44694.447916666664 | 7.71 |
| 44694.458333333336 | 7.72 |
| 44694.46875 | 7.72 |
| 44694.479166666664 | 7.69 |
| 44694.489583333336 | 7.69 |
| 44694.5 | 7.68 |
| 44694.510416666664 | 7.69 |
| 44694.520833333336 | 7.69 |
| 44694.53125 | 7.69 |
| 44694.541666666664 | 7.69 |
| 44694.552083333336 | 7.68 |
| 44694.5625 | 7.66 |
| 44694.572916666664 | 7.66 |
| 44694.583333333336 | 7.64 |
| 44694.59375 | 7.65 |
| 44694.604166666664 | 7.65 |
| 44694.614583333336 | 7.66 |
| 44694.625 | 7.66 |
| 44694.635416666664 | 7.67 |
| 44694.645833333336 | 7.67 |
| 44694.65625 | 7.66 |
| 44694.666666666664 | 7.66 |
| 44694.677083333336 | 7.66 |
| 44694.6875 | 7.66 |
| 44694.697916666664 | 7.65 |
| 44694.708333333336 | 7.65 |
| 44694.71875 | 7.65 |
| 44694.729166666664 | 7.65 |
| 44694.739583333336 | 7.64 |
| 44694.75 | 7.64 |
| 44694.760416666664 | 7.64 |
| 44694.770833333336 | 7.65 |
| 44694.78125 | 7.65 |
| 44694.791666666664 | 7.67 |
| 44694.802083333336 | 7.68 |
| 44694.8125 | 7.69 |
| 44694.822916666664 | 7.68 |
| 44694.833333333336 | 7.68 |
| 44694.84375 | 7.67 |
| 44694.854166666664 | 7.67 |
| 44694.864583333336 | 7.67 |
| 44694.875 | 7.66 |
| 44694.885416666664 | 7.67 |
| 44694.895833333336 | 7.67 |
| 44694.90625 | 7.67 |
| 44694.916666666664 | 7.69 |
| 44694.927083333336 | 7.7 |
| 44694.9375 | 7.7 |
| 44694.947916666664 | 7.7 |
| 44694.958333333336 | 7.71 |
| 44694.96875 | 7.71 |
| 44694.979166666664 | 7.7 |
| 44694.989583333336 | 7.7 |
| 44695.0 | 7.7 |
| 44695.010416666664 | 7.69 |
| 44695.020833333336 | 7.68 |
| 44695.03125 | 7.68 |
| 44695.041666666664 | 7.69 |
| 44695.052083333336 | 7.68 |
| 44695.0625 | 7.68 |
| 44695.072916666664 | 7.68 |
| 44695.083333333336 | 7.67 |
| 44695.09375 | 7.66 |
| 44695.104166666664 | 7.63 |
| 44695.114583333336 | 7.6 |
| 44695.125 | 7.59 |
| 44695.135416666664 | 7.57 |
| 44695.145833333336 | 7.58 |
| 44695.15625 | 7.55 |
| 44695.166666666664 | 7.59 |
| 44695.177083333336 | 7.59 |
| 44695.1875 | 7.59 |
| 44695.197916666664 | 7.57 |
| 44695.208333333336 | 7.54 |
| 44695.21875 | 7.54 |
| 44695.229166666664 | 7.54 |
| 44695.239583333336 | 7.52 |
| 44695.25 | 7.51 |
| 44695.260416666664 | 7.52 |
| 44695.270833333336 | 7.52 |
| 44695.28125 | 7.53 |
| 44695.291666666664 | 7.53 |
| 44695.302083333336 | 7.54 |
| 44695.3125 | 7.56 |
| 44695.322916666664 | 7.57 |
| 44695.333333333336 | 7.58 |
| 44695.34375 | 7.58 |
| 44695.354166666664 | 7.59 |
| 44695.364583333336 | 7.59 |
| 44695.375 | 7.59 |
| 44695.385416666664 | 7.59 |
| 44695.395833333336 | 7.59 |
| 44695.40625 | 7.6 |
| 44695.416666666664 | 7.6 |
| 44695.427083333336 | 7.61 |
| 44695.4375 | 7.62 |
| 44695.447916666664 | 7.62 |
| 44695.458333333336 | 7.63 |
| 44695.46875 | 7.63 |
| 44695.479166666664 | 7.64 |
| 44695.489583333336 | 7.64 |
| 44695.5 | 7.64 |
| 44695.510416666664 | 7.62 |
| 44695.520833333336 | 7.61 |
| 44695.53125 | 7.62 |
| 44695.541666666664 | 7.61 |
| 44695.552083333336 | 7.61 |
| 44695.5625 | 7.61 |
| 44695.572916666664 | 7.61 |
| 44695.583333333336 | 7.59 |
| 44695.59375 | 7.54 |
| 44695.604166666664 | 7.52 |
| 44695.614583333336 | 7.51 |
| 44695.625 | 7.5 |
| 44695.635416666664 | 7.51 |
| 44695.645833333336 | 7.49 |
| 44695.65625 | 7.49 |
| 44695.666666666664 | 7.5 |
| 44695.677083333336 | 7.49 |
| 44695.6875 | 7.49 |
| 44695.697916666664 | 7.48 |
| 44695.708333333336 | 7.47 |
| 44695.71875 | 7.46 |
| 44695.729166666664 | 7.45 |
| 44695.739583333336 | 7.46 |
| 44695.75 | 7.46 |
| 44695.760416666664 | 7.48 |
| 44695.770833333336 | 7.48 |
| 44695.78125 | 7.46 |
| 44695.791666666664 | 7.47 |
| 44695.802083333336 | 7.48 |
| 44695.8125 | 7.5 |
| 44695.822916666664 | 7.52 |
| 44695.833333333336 | 7.54 |
| 44695.84375 | 7.55 |
| 44695.854166666664 | 7.55 |
| 44695.864583333336 | 7.55 |
| 44695.875 | 7.55 |
| 44695.885416666664 | 7.56 |
| 44695.895833333336 | 7.57 |
| 44695.90625 | 7.58 |
| 44695.916666666664 | 7.6 |
| 44695.927083333336 | 7.62 |
| 44695.9375 | 7.62 |
| 44695.947916666664 | 7.63 |
| 44695.958333333336 | 7.63 |
| 44695.96875 | 7.63 |
| 44695.979166666664 | 7.62 |
| 44695.989583333336 | 7.62 |
| 44696.0 | 7.61 |
| 44696.010416666664 | 7.61 |
| 44696.020833333336 | 7.61 |
| 44696.03125 | 7.61 |
| 44696.041666666664 | 7.6 |
| 44696.052083333336 | 7.59 |
| 44696.0625 | 7.58 |
| 44696.072916666664 | 7.58 |
| 44696.083333333336 | 7.56 |
| 44696.09375 | 7.55 |
| 44696.104166666664 | 7.53 |
| 44696.114583333336 | 7.52 |
| 44696.125 | 7.52 |
| 44696.135416666664 | 7.51 |
| 44696.145833333336 | 7.49 |
| 44696.15625 | 7.44 |
| 44696.166666666664 | 7.39 |
| 44696.177083333336 | 7.4 |
| 44696.1875 | 7.39 |
| 44696.197916666664 | 7.4 |
| 44696.208333333336 | 7.43 |
| 44696.21875 | 7.4 |
| 44696.229166666664 | 7.39 |
| 44696.239583333336 | 7.38 |
| 44696.25 | 7.36 |
| 44696.260416666664 | 7.34 |
| 44696.270833333336 | 7.32 |
| 44696.28125 | 7.31 |
| 44696.291666666664 | 7.31 |
| 44696.302083333336 | 7.32 |
| 44696.3125 | 7.33 |
| 44696.322916666664 | 7.34 |
| 44696.333333333336 | 7.36 |
| 44696.34375 | 7.39 |
| 44696.354166666664 | 7.41 |
| 44696.364583333336 | 7.43 |
| 44696.375 | 7.44 |
| 44696.385416666664 | 7.45 |
| 44696.395833333336 | 7.45 |
| 44696.40625 | 7.46 |
| 44696.416666666664 | 7.47 |
| 44696.427083333336 | 7.48 |
| 44696.4375 | 7.49 |
| 44696.447916666664 | 7.5 |
| 44696.458333333336 | 7.51 |
| 44696.46875 | 7.52 |
| 44696.479166666664 | 7.53 |
| 44696.489583333336 | 7.54 |
| 44696.5 | 7.54 |
| 44696.510416666664 | 7.54 |
| 44696.520833333336 | 7.54 |
| 44696.53125 | 7.54 |
| 44696.541666666664 | 7.54 |
| 44696.552083333336 | 7.53 |
| 44696.5625 | 7.53 |
| 44696.572916666664 | 7.53 |
| 44696.583333333336 | 7.53 |
| 44696.59375 | 7.51 |
| 44696.604166666664 | 7.51 |
| 44696.614583333336 | 7.49 |
| 44696.625 | 7.49 |
| 44696.635416666664 | 7.48 |
| 44696.645833333336 | 7.48 |
| 44696.65625 | 7.49 |
| 44696.666666666664 | 7.49 |
| 44696.677083333336 | 7.49 |
| 44696.6875 | 7.48 |
| 44696.697916666664 | 7.47 |
| 44696.708333333336 | 7.46 |
| 44696.71875 | 7.44 |
| 44696.729166666664 | 7.44 |
| 44696.739583333336 | 7.44 |
| 44696.75 | 7.45 |
| 44696.760416666664 | 7.46 |
| 44696.770833333336 | 7.46 |
| 44696.78125 | 7.47 |
| 44696.791666666664 | 7.45 |
| 44696.802083333336 | 7.44 |
| 44696.8125 | 7.43 |
| 44696.822916666664 | 7.43 |
| 44696.833333333336 | 7.44 |
| 44696.84375 | 7.47 |
| 44696.854166666664 | 7.5 |
| 44696.864583333336 | 7.5 |
| 44696.875 | 7.5 |
| 44696.885416666664 | 7.5 |
| 44696.895833333336 | 7.5 |
| 44696.90625 | 7.5 |
| 44696.916666666664 | 7.51 |
| 44696.927083333336 | 7.51 |
| 44696.9375 | 7.52 |
| 44696.947916666664 | 7.54 |
| 44696.958333333336 | 7.54 |
| 44696.96875 | 7.55 |
| 44696.979166666664 | 7.54 |
| 44696.989583333336 | 7.54 |
| 44697.0 | 7.53 |
| 44697.010416666664 | 7.52 |
| 44697.020833333336 | 7.52 |
| 44697.03125 | 7.53 |
| 44697.041666666664 | 7.53 |
| 44697.052083333336 | 7.53 |
| 44697.0625 | 7.53 |
| 44697.072916666664 | 7.53 |
| 44697.083333333336 | 7.53 |
| 44697.09375 | 7.53 |
| 44697.104166666664 | 7.52 |
| 44697.114583333336 | 7.5 |
| 44697.125 | 7.5 |
| 44697.135416666664 | 7.49 |
| 44697.145833333336 | 7.47 |
| 44697.15625 | 7.45 |
| 44697.166666666664 | 7.44 |
| 44697.177083333336 | 7.41 |
| 44697.1875 | 7.39 |
| 44697.197916666664 | 7.37 |
| 44697.208333333336 | 7.35 |
| 44697.21875 | 7.36 |
| 44697.229166666664 | 7.37 |
| 44697.239583333336 | 7.42 |
| 44697.25 | 7.41 |
| 44697.260416666664 | 7.4 |
| 44697.270833333336 | 7.37 |
| 44697.28125 | 7.34 |
| 44697.291666666664 | 7.31 |
| 44697.302083333336 | 7.29 |
| 44697.3125 | 7.28 |
| 44697.322916666664 | 7.27 |
| 44697.333333333336 | 7.28 |
| 44697.34375 | 7.29 |
| 44697.354166666664 | 7.29 |
| 44697.364583333336 | 7.32 |
| 44697.375 | 7.34 |
| 44697.385416666664 | 7.36 |
| 44697.395833333336 | 7.38 |
| 44697.40625 | 7.39 |
| 44697.416666666664 | 7.4 |
| 44697.427083333336 | 7.4 |
| 44697.4375 | 7.41 |
| 44697.447916666664 | 7.42 |
| 44697.458333333336 | 7.43 |
| 44697.46875 | 7.44 |
| 44697.479166666664 | 7.45 |
| 44697.489583333336 | 7.46 |
| 44697.5 | 7.47 |
| 44697.510416666664 | 7.48 |
| 44697.520833333336 | 7.48 |
| 44697.53125 | 7.48 |
| 44697.541666666664 | 7.48 |
| 44697.552083333336 | 7.48 |
| 44697.5625 | 7.48 |
| 44697.572916666664 | 7.48 |
| 44697.583333333336 | 7.47 |
| 44697.59375 | 7.46 |
| 44697.604166666664 | 7.47 |
| 44697.614583333336 | 7.48 |
| 44697.625 | 7.49 |
| 44697.635416666664 | 7.52 |
| 44697.645833333336 | 7.52 |
| 44697.65625 | 7.52 |
| 44697.666666666664 | 7.53 |
| 44697.677083333336 | 7.53 |
| 44697.6875 | 7.53 |
| 44697.697916666664 | 7.54 |
| 44697.708333333336 | 7.54 |
| 44697.71875 | 7.55 |
| 44697.729166666664 | 7.55 |
| 44697.739583333336 | 7.56 |
| 44697.75 | 7.56 |
| 44697.760416666664 | 7.57 |
| 44697.770833333336 | 7.57 |
| 44697.78125 | 7.57 |
| 44697.791666666664 | 7.58 |
| 44697.802083333336 | 7.57 |
| 44697.8125 | 7.58 |
| 44697.822916666664 | 7.59 |
| 44697.833333333336 | 7.59 |
| 44697.84375 | 7.57 |
| 44697.854166666664 | 7.55 |
| 44697.864583333336 | 7.56 |
| 44697.875 | 7.55 |
| 44697.885416666664 | 7.54 |
| 44697.895833333336 | 7.54 |
| 44697.90625 | 7.53 |
| 44697.916666666664 | 7.53 |
| 44697.927083333336 | 7.52 |
| 44697.9375 | 7.52 |
| 44697.947916666664 | 7.52 |
| 44697.958333333336 | 7.52 |
| 44697.96875 | 7.52 |
| 44697.979166666664 | 7.52 |
| 44697.989583333336 | 7.53 |
| 44698.0 | 7.54 |
| 44698.010416666664 | 7.54 |
| 44698.020833333336 | 7.53 |
| 44698.03125 | 7.52 |
| 44698.041666666664 | 7.53 |
| 44698.052083333336 | 7.53 |
| 44698.0625 | 7.53 |
| 44698.072916666664 | 7.53 |
| 44698.083333333336 | 7.53 |
| 44698.09375 | 7.53 |
| 44698.104166666664 | 7.53 |
| 44698.114583333336 | 7.52 |
| 44698.125 | 7.52 |
| 44698.135416666664 | 7.51 |
| 44698.145833333336 | 7.5 |
| 44698.15625 | 7.49 |
| 44698.166666666664 | 7.49 |
| 44698.177083333336 | 7.47 |
| 44698.1875 | 7.44 |
| 44698.197916666664 | 7.42 |
| 44698.208333333336 | 7.4 |
| 44698.21875 | 7.37 |
| 44698.229166666664 | 7.34 |
| 44698.239583333336 | 7.31 |
| 44698.25 | 7.35 |
| 44698.260416666664 | 7.39 |
| 44698.270833333336 | 7.42 |
| 44698.28125 | 7.42 |
| 44698.291666666664 | 7.38 |
| 44698.302083333336 | 7.36 |
| 44698.3125 | 7.34 |
| 44698.322916666664 | 7.3 |
| 44698.333333333336 | 7.28 |
| 44698.34375 | 7.26 |
| 44698.354166666664 | 7.26 |
| 44698.364583333336 | 7.25 |
| 44698.375 | 7.26 |
| 44698.385416666664 | 7.26 |
| 44698.395833333336 | 7.28 |
| 44698.40625 | 7.29 |
| 44698.416666666664 | 7.33 |
| 44698.427083333336 | 7.35 |
| 44698.4375 | 7.36 |
| 44698.447916666664 | 7.38 |
| 44698.458333333336 | 7.39 |
| 44698.46875 | 7.39 |
| 44698.479166666664 | 7.4 |
| 44698.489583333336 | 7.41 |
| 44698.5 | 7.42 |
| 44698.510416666664 | 7.44 |
| 44698.520833333336 | 7.45 |
| 44698.53125 | 7.47 |
| 44698.541666666664 | 7.48 |
| 44698.552083333336 | 7.5 |
| 44698.5625 | 7.51 |
| 44698.572916666664 | 7.51 |
| 44698.583333333336 | 7.52 |
| 44698.59375 | 7.52 |
| 44698.604166666664 | 7.52 |
| 44698.614583333336 | 7.52 |
| 44698.625 | 7.52 |
| 44698.635416666664 | 7.52 |
| 44698.645833333336 | 7.53 |
| 44698.65625 | 7.53 |
| 44698.666666666664 | 7.54 |
| 44698.677083333336 | 7.55 |
| 44698.6875 | 7.56 |
| 44698.697916666664 | 7.56 |
| 44698.708333333336 | 7.57 |
| 44698.71875 | 7.56 |
| 44698.729166666664 | 7.56 |
| 44698.739583333336 | 7.57 |
| 44698.75 | 7.58 |
| 44698.760416666664 | 7.59 |
| 44698.770833333336 | 7.58 |
| 44698.78125 | 7.59 |
| 44698.791666666664 | 7.58 |
| 44698.802083333336 | 7.58 |
| 44698.8125 | 7.59 |
| 44698.822916666664 | 7.6 |
| 44698.833333333336 | 7.61 |
| 44698.84375 | 7.62 |
| 44698.854166666664 | 7.63 |
| 44698.864583333336 | 7.61 |
| 44698.875 | 7.58 |
| 44698.885416666664 | 7.56 |
| 44698.895833333336 | 7.56 |
| 44698.90625 | 7.57 |
| 44698.916666666664 | 7.58 |
| 44698.927083333336 | 7.57 |
| 44698.9375 | 7.57 |
| 44698.947916666664 | 7.56 |
| 44698.958333333336 | 7.55 |
| 44698.96875 | 7.54 |
| 44698.979166666664 | 7.54 |
| 44698.989583333336 | 7.54 |
| 44699.0 | 7.54 |
| 44699.010416666664 | 7.55 |
| 44699.020833333336 | 7.57 |
| 44699.03125 | 7.57 |
| 44699.041666666664 | 7.58 |
| 44699.052083333336 | 7.57 |
| 44699.0625 | 7.57 |
| 44699.072916666664 | 7.56 |
| 44699.083333333336 | 7.56 |
| 44699.09375 | 7.56 |
| 44699.104166666664 | 7.56 |
| 44699.114583333336 | 7.57 |
| 44699.125 | 7.57 |
| 44699.135416666664 | 7.57 |
| 44699.145833333336 | 7.56 |
| 44699.15625 | 7.56 |
| 44699.166666666664 | 7.56 |
| 44699.177083333336 | 7.54 |
| 44699.1875 | 7.53 |
| 44699.197916666664 | 7.52 |
| 44699.208333333336 | 7.5 |
| 44699.21875 | 7.47 |
| 44699.229166666664 | 7.44 |
| 44699.239583333336 | 7.42 |
| 44699.25 | 7.39 |
| 44699.260416666664 | 7.37 |
| 44699.270833333336 | 7.35 |
| 44699.28125 | 7.39 |
| 44699.291666666664 | 7.46 |
| 44699.302083333336 | 7.48 |
| 44699.3125 | 7.48 |
| 44699.322916666664 | 7.47 |
| 44699.333333333336 | 7.44 |
| 44699.34375 | 7.43 |
| 44699.354166666664 | 7.41 |
| 44699.364583333336 | 7.39 |
| 44699.375 | 7.37 |
| 44699.385416666664 | 7.35 |
| 44699.395833333336 | 7.35 |
| 44699.40625 | 7.35 |
| 44699.416666666664 | 7.36 |
| 44699.427083333336 | 7.36 |
| 44699.4375 | 7.37 |
| 44699.447916666664 | 7.39 |
| 44699.458333333336 | 7.41 |
| 44699.46875 | 7.41 |
| 44699.479166666664 | 7.42 |
| 44699.489583333336 | 7.43 |
| 44699.5 | 7.43 |
| 44699.510416666664 | 7.43 |
| 44699.520833333336 | 7.44 |
| 44699.53125 | 7.45 |
| 44699.541666666664 | 7.46 |
| 44699.552083333336 | 7.47 |
| 44699.5625 | 7.48 |
| 44699.572916666664 | 7.5 |
| 44699.583333333336 | 7.51 |
| 44699.59375 | 7.52 |
| 44699.604166666664 | 7.54 |
| 44699.614583333336 | 7.54 |
| 44699.625 | 7.55 |
| 44699.635416666664 | 7.56 |
| 44699.645833333336 | 7.56 |
| 44699.65625 | 7.54 |
| 44699.666666666664 | 7.57 |
| 44699.677083333336 | 7.58 |
| 44699.6875 | 7.58 |
| 44699.697916666664 | 7.59 |
| 44699.708333333336 | 7.6 |
| 44699.71875 | 7.6 |
| 44699.729166666664 | 7.61 |
| 44699.739583333336 | 7.61 |
| 44699.75 | 7.61 |
| 44699.760416666664 | 7.61 |
| 44699.770833333336 | 7.62 |
| 44699.78125 | 7.63 |
| 44699.791666666664 | 7.65 |
| 44699.802083333336 | 7.66 |
| 44699.8125 | 7.67 |
| 44699.822916666664 | 7.68 |
| 44699.833333333336 | 7.69 |
| 44699.84375 | 7.71 |
| 44699.854166666664 | 7.73 |
| 44699.864583333336 | 7.75 |
| 44699.875 | 7.76 |
| 44699.885416666664 | 7.76 |
| 44699.895833333336 | 7.76 |
| 44699.90625 | 7.74 |
| 44699.916666666664 | 7.72 |
| 44699.927083333336 | 7.69 |
| 44699.9375 | 7.68 |
| 44699.947916666664 | 7.66 |
| 44699.958333333336 | 7.64 |
| 44699.96875 | 7.62 |
| 44699.979166666664 | 7.61 |
| 44699.989583333336 | 7.6 |
| 44700.0 | 7.59 |
| 44700.010416666664 | 7.58 |
| 44700.020833333336 | 7.58 |
| 44700.03125 | 7.59 |
| 44700.041666666664 | 7.58 |
| 44700.052083333336 | 7.58 |
| 44700.0625 | 7.58 |
| 44700.072916666664 | 7.58 |
| 44700.083333333336 | 7.58 |
| 44700.09375 | 7.58 |
| 44700.104166666664 | 7.57 |
| 44700.114583333336 | 7.57 |
| 44700.125 | 7.57 |
| 44700.135416666664 | 7.58 |
| 44700.145833333336 | 7.57 |
| 44700.15625 | 7.57 |
| 44700.166666666664 | 7.58 |
| 44700.177083333336 | 7.57 |
| 44700.1875 | 7.56 |
| 44700.197916666664 | 7.57 |
| 44700.208333333336 | 7.56 |
| 44700.21875 | 7.56 |
| 44700.229166666664 | 7.56 |
| 44700.239583333336 | 7.54 |
| 44700.25 | 7.53 |
| 44700.260416666664 | 7.51 |
| 44700.270833333336 | 7.5 |
| 44700.28125 | 7.49 |
| 44700.291666666664 | 7.47 |
| 44700.302083333336 | 7.46 |
| 44700.3125 | 7.5 |
| 44700.322916666664 | 7.5 |
| 44700.333333333336 | 7.5 |
| 44700.34375 | 7.52 |
| 44700.354166666664 | 7.53 |
| 44700.364583333336 | 7.55 |
| 44700.375 | 7.55 |
| 44700.385416666664 | 7.54 |
| 44700.395833333336 | 7.54 |
| 44700.40625 | 7.52 |
| 44700.416666666664 | 7.51 |
| 44700.427083333336 | 7.5 |
| 44700.4375 | 7.5 |
| 44700.447916666664 | 7.5 |
| 44700.458333333336 | 7.5 |
| 44700.46875 | 7.5 |
| 44700.479166666664 | 7.5 |
| 44700.489583333336 | 7.5 |
| 44700.5 | 7.5 |
| 44700.510416666664 | 7.5 |
| 44700.520833333336 | 7.51 |
| 44700.53125 | 7.51 |
| 44700.541666666664 | 7.51 |
| 44700.552083333336 | 7.51 |
| 44700.5625 | 7.5 |
| 44700.572916666664 | 7.51 |
| 44700.583333333336 | 7.51 |
| 44700.59375 | 7.51 |
| 44700.604166666664 | 7.52 |
| 44700.614583333336 | 7.54 |
| 44700.625 | 7.55 |
| 44700.635416666664 | 7.56 |
| 44700.645833333336 | 7.57 |
| 44700.65625 | 7.57 |
| 44700.666666666664 | 7.57 |
| 44700.677083333336 | 7.57 |
| 44700.6875 | 7.57 |
| 44700.697916666664 | 7.58 |
| 44700.708333333336 | 7.58 |
| 44700.71875 | 7.6 |
| 44700.729166666664 | 7.61 |
| 44700.739583333336 | 7.62 |
| 44700.75 | 7.62 |
| 44700.760416666664 | 7.63 |
| 44700.770833333336 | 7.63 |
| 44700.78125 | 7.64 |
| 44700.791666666664 | 7.65 |
| 44700.802083333336 | 7.65 |
| 44700.8125 | 7.67 |
| 44700.822916666664 | 7.69 |
| 44700.833333333336 | 7.72 |
| 44700.84375 | 7.74 |
| 44700.854166666664 | 7.74 |
| 44700.864583333336 | 7.75 |
| 44700.875 | 7.78 |
| 44700.885416666664 | 7.82 |
| 44700.895833333336 | 7.85 |
| 44700.90625 | 7.87 |
| 44700.916666666664 | 7.87 |
| 44700.927083333336 | 7.87 |
| 44700.9375 | 7.84 |
| 44700.947916666664 | 7.82 |
| 44700.958333333336 | 7.78 |
| 44700.96875 | 7.75 |
| 44700.979166666664 | 7.72 |
| 44700.989583333336 | 7.69 |
| 44701.0 | 7.67 |
| 44701.010416666664 | 7.64 |
| 44701.020833333336 | 7.62 |
| 44701.03125 | 7.6 |
| 44701.041666666664 | 7.58 |
| 44701.052083333336 | 7.56 |
| 44701.0625 | 7.56 |
| 44701.072916666664 | 7.56 |
| 44701.083333333336 | 7.56 |
| 44701.09375 | 7.57 |
| 44701.104166666664 | 7.57 |
| 44701.114583333336 | 7.58 |
| 44701.125 | 7.58 |
| 44701.135416666664 | 7.58 |
| 44701.145833333336 | 7.58 |
| 44701.15625 | 7.58 |
| 44701.166666666664 | 7.58 |
| 44701.177083333336 | 7.58 |
| 44701.1875 | 7.58 |
| 44701.197916666664 | 7.58 |
| 44701.208333333336 | 7.57 |
| 44701.21875 | 7.57 |
| 44701.229166666664 | 7.57 |
| 44701.239583333336 | 7.57 |
| 44701.25 | 7.55 |
| 44701.260416666664 | 7.54 |
| 44701.270833333336 | 7.53 |
| 44701.28125 | 7.51 |
| 44701.291666666664 | 7.48 |
| 44701.302083333336 | 7.46 |
| 44701.3125 | 7.45 |
| 44701.322916666664 | 7.43 |
| 44701.333333333336 | 7.41 |
| 44701.34375 | 7.39 |
| 44701.354166666664 | 7.37 |
| 44701.364583333336 | 7.37 |
| 44701.375 | 7.4 |
| 44701.385416666664 | 7.49 |
| 44701.395833333336 | 7.51 |
| 44701.40625 | 7.53 |
| 44701.416666666664 | 7.53 |
| 44701.427083333336 | 7.52 |
| 44701.4375 | 7.52 |
| 44701.447916666664 | 7.51 |
| 44701.458333333336 | 7.5 |
| 44701.46875 | 7.49 |
| 44701.479166666664 | 7.49 |
| 44701.489583333336 | 7.49 |
| 44701.5 | 7.49 |
| 44701.510416666664 | 7.49 |
| 44701.520833333336 | 7.48 |
| 44701.53125 | 7.48 |
| 44701.541666666664 | 7.46 |
| 44701.552083333336 | 7.46 |
| 44701.5625 | 7.42 |
| 44701.572916666664 | 7.45 |
| 44701.583333333336 | 7.47 |
| 44701.59375 | 7.48 |
| 44701.604166666664 | 7.49 |
| 44701.614583333336 | 7.49 |
| 44701.625 | 7.5 |
| 44701.635416666664 | 7.5 |
| 44701.645833333336 | 7.52 |
| 44701.65625 | 7.53 |
| 44701.666666666664 | 7.54 |
| 44701.677083333336 | 7.55 |
| 44701.6875 | 7.56 |
| 44701.697916666664 | 7.57 |
| 44701.708333333336 | 7.57 |
| 44701.71875 | 7.57 |
| 44701.729166666664 | 7.54 |
| 44701.739583333336 | 7.55 |
| 44701.75 | 7.57 |
| 44701.760416666664 | 7.61 |
| 44701.770833333336 | 7.65 |
| 44701.78125 | 7.67 |
| 44701.791666666664 | 7.67 |
| 44701.802083333336 | 7.67 |
| 44701.8125 | 7.66 |
| 44701.822916666664 | 7.68 |
| 44701.833333333336 | 7.69 |
| 44701.84375 | 7.7 |
| 44701.854166666664 | 7.69 |
| 44701.864583333336 | 7.71 |
| 44701.875 | 7.71 |
| 44701.885416666664 | 7.76 |
| 44701.895833333336 | 7.77 |
| 44701.90625 | 7.79 |
| 44701.916666666664 | 7.82 |
| 44701.927083333336 | 7.84 |
| 44701.9375 | 7.85 |
| 44701.947916666664 | 7.85 |
| 44701.958333333336 | 7.85 |
| 44701.96875 | 7.85 |
| 44701.979166666664 | 7.82 |
| 44701.989583333336 | 7.8 |
| 44702.0 | 7.78 |
| 44702.010416666664 | 7.76 |
| 44702.020833333336 | 7.74 |
| 44702.03125 | 7.7 |
| 44702.041666666664 | 7.68 |
| 44702.052083333336 | 7.66 |
| 44702.0625 | 7.64 |
| 44702.072916666664 | 7.63 |
| 44702.083333333336 | 7.61 |
| 44702.09375 | 7.61 |
| 44702.104166666664 | 7.6 |
| 44702.114583333336 | 7.59 |
| 44702.125 | 7.58 |
| 44702.135416666664 | 7.58 |
| 44702.145833333336 | 7.58 |
| 44702.15625 | 7.58 |
| 44702.166666666664 | 7.58 |
| 44702.177083333336 | 7.59 |
| 44702.1875 | 7.59 |
| 44702.197916666664 | 7.6 |
| 44702.208333333336 | 7.59 |
| 44702.21875 | 7.59 |
| 44702.229166666664 | 7.59 |
| 44702.239583333336 | 7.58 |
| 44702.25 | 7.57 |
| 44702.260416666664 | 7.57 |
| 44702.270833333336 | 7.58 |
| 44702.28125 | 7.57 |
| 44702.291666666664 | 7.56 |
| 44702.302083333336 | 7.53 |
| 44702.3125 | 7.51 |
| 44702.322916666664 | 7.49 |
| 44702.333333333336 | 7.47 |
| 44702.34375 | 7.47 |
| 44702.354166666664 | 7.44 |
| 44702.364583333336 | 7.42 |
| 44702.375 | 7.41 |
| 44702.385416666664 | 7.41 |
| 44702.395833333336 | 7.45 |
| 44702.40625 | 7.47 |
| 44702.416666666664 | 7.53 |
| 44702.427083333336 | 7.55 |
| 44702.4375 | 7.56 |
| 44702.447916666664 | 7.55 |
| 44702.458333333336 | 7.56 |
| 44702.46875 | 7.55 |
| 44702.479166666664 | 7.55 |
| 44702.489583333336 | 7.55 |
| 44702.5 | 7.54 |
| 44702.510416666664 | 7.54 |
| 44702.520833333336 | 7.54 |
| 44702.53125 | 7.52 |
| 44702.541666666664 | 7.52 |
| 44702.552083333336 | 7.52 |
| 44702.5625 | 7.51 |
| 44702.572916666664 | 7.5 |
| 44702.583333333336 | 7.5 |
| 44702.59375 | 7.51 |
| 44702.604166666664 | 7.51 |
| 44702.614583333336 | 7.5 |
| 44702.625 | 7.5 |
| 44702.635416666664 | 7.5 |
| 44702.645833333336 | 7.5 |
| 44702.65625 | 7.5 |
| 44702.666666666664 | 7.5 |
| 44702.677083333336 | 7.51 |
| 44702.6875 | 7.52 |
| 44702.697916666664 | 7.54 |
| 44702.708333333336 | 7.55 |
| 44702.71875 | 7.57 |
| 44702.729166666664 | 7.58 |
| 44702.739583333336 | 7.59 |
| 44702.75 | 7.58 |
| 44702.760416666664 | 7.59 |
| 44702.770833333336 | 7.54 |
| 44702.78125 | 7.57 |
| 44702.791666666664 | 7.58 |
| 44702.802083333336 | 7.62 |
| 44702.8125 | 7.62 |
| 44702.822916666664 | 7.65 |
| 44702.833333333336 | 7.66 |
| 44702.84375 | 7.65 |
| 44702.854166666664 | 7.66 |
| 44702.864583333336 | 7.67 |
| 44702.875 | 7.66 |
| 44702.885416666664 | 7.66 |
| 44702.895833333336 | 7.66 |
| 44702.90625 | 7.7 |
| 44702.916666666664 | 7.75 |
| 44702.927083333336 | 7.78 |
| 44702.9375 | 7.79 |
| 44702.947916666664 | 7.8 |
| 44702.958333333336 | 7.81 |
| 44702.96875 | 7.83 |
| 44702.979166666664 | 7.83 |
| 44702.989583333336 | 7.84 |
| 44703.0 | 7.83 |
| 44703.010416666664 | 7.83 |
| 44703.020833333336 | 7.8 |
| 44703.03125 | 7.78 |
| 44703.041666666664 | 7.76 |
| 44703.052083333336 | 7.74 |
| 44703.0625 | 7.71 |
| 44703.072916666664 | 7.67 |
| 44703.083333333336 | 7.64 |
| 44703.09375 | 7.63 |
| 44703.104166666664 | 7.61 |
| 44703.114583333336 | 7.6 |
| 44703.125 | 7.59 |
| 44703.135416666664 | 7.59 |
| 44703.145833333336 | 7.58 |
| 44703.15625 | 7.58 |
| 44703.166666666664 | 7.58 |
| 44703.177083333336 | 7.57 |
| 44703.1875 | 7.58 |
| 44703.197916666664 | 7.58 |
| 44703.208333333336 | 7.58 |
| 44703.21875 | 7.58 |
| 44703.229166666664 | 7.58 |
| 44703.239583333336 | 7.59 |
| 44703.25 | 7.59 |
| 44703.260416666664 | 7.59 |
| 44703.270833333336 | 7.59 |
| 44703.28125 | 7.59 |
| 44703.291666666664 | 7.57 |
| 44703.302083333336 | 7.57 |
| 44703.3125 | 7.57 |
| 44703.322916666664 | 7.57 |
| 44703.333333333336 | 7.55 |
| 44703.34375 | 7.53 |
| 44703.354166666664 | 7.51 |
| 44703.364583333336 | 7.5 |
| 44703.375 | 7.48 |
| 44703.385416666664 | 7.45 |
| 44703.395833333336 | 7.42 |
| 44703.40625 | 7.41 |
| 44703.416666666664 | 7.41 |
| 44703.427083333336 | 7.47 |
| 44703.4375 | 7.48 |
| 44703.447916666664 | 7.51 |
| 44703.458333333336 | 7.52 |
| 44703.46875 | 7.53 |
| 44703.479166666664 | 7.54 |
| 44703.489583333336 | 7.54 |
| 44703.5 | 7.54 |
| 44703.510416666664 | 7.54 |
| 44703.520833333336 | 7.55 |
| 44703.53125 | 7.54 |
| 44703.541666666664 | 7.55 |
| 44703.552083333336 | 7.54 |
| 44703.5625 | 7.54 |
| 44703.572916666664 | 7.53 |
| 44703.583333333336 | 7.52 |
| 44703.59375 | 7.51 |
| 44703.604166666664 | 7.51 |
| 44703.614583333336 | 7.51 |
| 44703.625 | 7.51 |
| 44703.635416666664 | 7.51 |
| 44703.645833333336 | 7.51 |
| 44703.65625 | 7.51 |
| 44703.666666666664 | 7.5 |
| 44703.677083333336 | 7.51 |
| 44703.6875 | 7.51 |
| 44703.697916666664 | 7.52 |
| 44703.708333333336 | 7.53 |
| 44703.71875 | 7.53 |
| 44703.729166666664 | 7.54 |
| 44703.739583333336 | 7.55 |
| 44703.75 | 7.56 |
| 44703.760416666664 | 7.57 |
| 44703.770833333336 | 7.57 |
| 44703.78125 | 7.58 |
| 44703.791666666664 | 7.6 |
| 44703.802083333336 | 7.59 |
| 44703.8125 | 7.56 |
| 44703.822916666664 | 7.58 |
| 44703.833333333336 | 7.59 |
| 44703.84375 | 7.6 |
| 44703.854166666664 | 7.59 |
| 44703.864583333336 | 7.66 |
| 44703.875 | 7.64 |
| 44703.885416666664 | 7.65 |
| 44703.895833333336 | 7.67 |
| 44703.90625 | 7.66 |
| 44703.916666666664 | 7.66 |
| 44703.927083333336 | 7.66 |
| 44703.9375 | 7.7 |
| 44703.947916666664 | 7.75 |
| 44703.958333333336 | 7.8 |
| 44703.96875 | 7.83 |
| 44703.979166666664 | 7.83 |
| 44703.989583333336 | 7.85 |
| 44704.0 | 7.86 |
| 44704.010416666664 | 7.86 |
| 44704.020833333336 | 7.86 |
| 44704.03125 | 7.87 |
| 44704.041666666664 | 7.88 |
| 44704.052083333336 | 7.89 |
| 44704.0625 | 7.88 |
| 44704.072916666664 | 7.84 |
| 44704.083333333336 | 7.83 |
| 44704.09375 | 7.82 |
| 44704.104166666664 | 7.8 |
| 44704.114583333336 | 7.78 |
| 44704.125 | 7.74 |
| 44704.135416666664 | 7.69 |
| 44704.145833333336 | 7.66 |
| 44704.15625 | 7.62 |
| 44704.166666666664 | 7.59 |
| 44704.177083333336 | 7.57 |
| 44704.1875 | 7.55 |
| 44704.197916666664 | 7.53 |
| 44704.208333333336 | 7.52 |
| 44704.21875 | 7.52 |
| 44704.229166666664 | 7.52 |
| 44704.239583333336 | 7.52 |
| 44704.25 | 7.52 |
| 44704.260416666664 | 7.52 |
| 44704.270833333336 | 7.52 |
| 44704.28125 | 7.53 |
| 44704.291666666664 | 7.53 |
| 44704.302083333336 | 7.54 |
| 44704.3125 | 7.54 |
| 44704.322916666664 | 7.54 |
| 44704.333333333336 | 7.53 |
| 44704.34375 | 7.53 |
| 44704.354166666664 | 7.54 |
| 44704.364583333336 | 7.52 |
| 44704.375 | 7.51 |
| 44704.385416666664 | 7.49 |
| 44704.395833333336 | 7.45 |
| 44704.40625 | 7.42 |
| 44704.416666666664 | 7.39 |
| 44704.427083333336 | 7.37 |
| 44704.4375 | 7.35 |
| 44704.447916666664 | 7.35 |
| 44704.458333333336 | 7.44 |
| 44704.46875 | 7.45 |
| 44704.479166666664 | 7.49 |
| 44704.489583333336 | 7.48 |
| 44704.5 | 7.5 |
| 44704.510416666664 | 7.52 |
| 44704.520833333336 | 7.53 |
| 44704.53125 | 7.55 |
| 44704.541666666664 | 7.56 |
| 44704.552083333336 | 7.57 |
| 44704.5625 | 7.57 |
| 44704.572916666664 | 7.57 |
| 44704.583333333336 | 7.57 |
| 44704.59375 | 7.57 |
| 44704.604166666664 | 7.55 |
| 44704.614583333336 | 7.54 |
| 44704.625 | 7.53 |
| 44704.635416666664 | 7.52 |
| 44704.645833333336 | 7.51 |
| 44704.65625 | 7.49 |
| 44704.666666666664 | 7.47 |
| 44704.677083333336 | 7.47 |
| 44704.6875 | 7.48 |
| 44704.697916666664 | 7.48 |
| 44704.708333333336 | 7.48 |
| 44704.71875 | 7.48 |
| 44704.729166666664 | 7.47 |
| 44704.739583333336 | 7.47 |
| 44704.75 | 7.48 |
| 44704.760416666664 | 7.49 |
| 44704.770833333336 | 7.5 |
| 44704.78125 | 7.51 |
| 44704.791666666664 | 7.52 |
| 44704.802083333336 | 7.52 |
| 44704.8125 | 7.53 |
| 44704.822916666664 | 7.54 |
| 44704.833333333336 | 7.53 |
| 44704.84375 | 7.55 |
| 44704.854166666664 | 7.55 |
| 44704.864583333336 | 7.56 |
| 44704.875 | 7.56 |
| 44704.885416666664 | 7.57 |
| 44704.895833333336 | 7.58 |
| 44704.90625 | 7.59 |
| 44704.916666666664 | 7.59 |
| 44704.927083333336 | 7.6 |
| 44704.9375 | 7.61 |
| 44704.947916666664 | 7.62 |
| 44704.958333333336 | 7.62 |
| 44704.96875 | 7.64 |
| 44704.979166666664 | 7.67 |
| 44704.989583333336 | 7.71 |
| 44705.0 | 7.73 |
| 44705.010416666664 | 7.73 |
| 44705.020833333336 | 7.76 |
| 44705.03125 | 7.76 |
| 44705.041666666664 | 7.76 |
| 44705.052083333336 | 7.75 |
| 44705.0625 | 7.75 |
| 44705.072916666664 | 7.75 |
| 44705.083333333336 | 7.75 |
| 44705.09375 | 7.76 |
| 44705.104166666664 | 7.76 |
| 44705.114583333336 | 7.76 |
| 44705.125 | 7.74 |
| 44705.135416666664 | 7.73 |
| 44705.145833333336 | 7.72 |
| 44705.15625 | 7.71 |
| 44705.166666666664 | 7.7 |
| 44705.177083333336 | 7.7 |
| 44705.1875 | 7.68 |
| 44705.197916666664 | 7.66 |
| 44705.208333333336 | 7.63 |
| 44705.21875 | 7.61 |
| 44705.229166666664 | 7.59 |
| 44705.239583333336 | 7.58 |
| 44705.25 | 7.56 |
| 44705.260416666664 | 7.55 |
| 44705.270833333336 | 7.54 |
| 44705.28125 | 7.54 |
| 44705.291666666664 | 7.53 |
| 44705.302083333336 | 7.53 |
| 44705.3125 | 7.54 |
| 44705.322916666664 | 7.54 |
| 44705.333333333336 | 7.54 |
| 44705.34375 | 7.54 |
| 44705.354166666664 | 7.54 |
| 44705.364583333336 | 7.54 |
| 44705.375 | 7.54 |
| 44705.385416666664 | 7.54 |
| 44705.395833333336 | 7.52 |
| 44705.40625 | 7.5 |
| 44705.416666666664 | 7.49 |
| 44705.427083333336 | 7.48 |
| 44705.4375 | 7.48 |
| 44705.447916666664 | 7.48 |
| 44705.458333333336 | 7.48 |
| 44705.46875 | 7.46 |
| 44705.479166666664 | 7.5 |
| 44705.489583333336 | 7.52 |
| 44705.5 | 7.53 |
| 44705.510416666664 | 7.52 |
| 44705.520833333336 | 7.53 |
| 44705.53125 | 7.55 |
| 44705.541666666664 | 7.55 |
| 44705.552083333336 | 7.54 |
| 44705.5625 | 7.55 |
| 44705.572916666664 | 7.55 |
| 44705.583333333336 | 7.55 |
| 44705.59375 | 7.56 |
| 44705.604166666664 | 7.56 |
| 44705.614583333336 | 7.56 |
| 44705.625 | 7.57 |
| 44705.635416666664 | 7.57 |
| 44705.645833333336 | 7.56 |
| 44705.65625 | 7.56 |
| 44705.666666666664 | 7.56 |
| 44705.677083333336 | 7.56 |
| 44705.6875 | 7.55 |
| 44705.697916666664 | 7.55 |
| 44705.708333333336 | 7.55 |
| 44705.71875 | 7.55 |
| 44705.729166666664 | 7.55 |
| 44705.739583333336 | 7.55 |
| 44705.75 | 7.56 |
| 44705.760416666664 | 7.56 |
| 44705.770833333336 | 7.57 |
| 44705.78125 | 7.57 |
| 44705.791666666664 | 7.57 |
| 44705.802083333336 | 7.58 |
| 44705.8125 | 7.58 |
| 44705.822916666664 | 7.58 |
| 44705.833333333336 | 7.58 |
| 44705.84375 | 7.59 |
| 44705.854166666664 | 7.59 |
| 44705.864583333336 | 7.59 |
| 44705.875 | 7.59 |
| 44705.885416666664 | 7.61 |
| 44705.895833333336 | 7.61 |
| 44705.90625 | 7.62 |
| 44705.916666666664 | 7.64 |
| 44705.927083333336 | 7.64 |
| 44705.9375 | 7.64 |
| 44705.947916666664 | 7.63 |
| 44705.958333333336 | 7.62 |
| 44705.96875 | 7.63 |
| 44705.979166666664 | 7.63 |
| 44705.989583333336 | 7.63 |
| 44706.0 | 7.63 |
| 44706.010416666664 | 7.63 |
| 44706.020833333336 | 7.62 |
| 44706.03125 | 7.61 |
| 44706.041666666664 | 7.6 |
| 44706.052083333336 | 7.59 |
| 44706.0625 | 7.59 |
| 44706.072916666664 | 7.58 |
| 44706.083333333336 | 7.58 |
| 44706.09375 | 7.59 |
| 44706.104166666664 | 7.62 |
| 44706.114583333336 | 7.61 |
| 44706.125 | 7.62 |
| 44706.135416666664 | 7.62 |
| 44706.145833333336 | 7.63 |
| 44706.15625 | 7.62 |
| 44706.166666666664 | 7.62 |
| 44706.177083333336 | 7.62 |
| 44706.1875 | 7.61 |
| 44706.197916666664 | 7.61 |
| 44706.208333333336 | 7.61 |
| 44706.21875 | 7.61 |
| 44706.229166666664 | 7.61 |
| 44706.239583333336 | 7.62 |
| 44706.25 | 7.62 |
| 44706.260416666664 | 7.63 |
| 44706.270833333336 | 7.63 |
| 44706.28125 | 7.63 |
| 44706.291666666664 | 7.64 |
| 44706.302083333336 | 7.65 |
| 44706.3125 | 7.65 |
| 44706.322916666664 | 7.65 |
| 44706.333333333336 | 7.65 |
| 44706.34375 | 7.65 |
| 44706.354166666664 | 7.66 |
| 44706.364583333336 | 7.66 |
| 44706.375 | 7.66 |
| 44706.385416666664 | 7.66 |
| 44706.395833333336 | 7.65 |
| 44706.40625 | 7.66 |
| 44706.416666666664 | 7.66 |
| 44706.427083333336 | 7.65 |
| 44706.4375 | 7.65 |
| 44706.447916666664 | 7.64 |
| 44706.458333333336 | 7.65 |
| 44706.46875 | 7.65 |
| 44706.479166666664 | 7.64 |
| 44706.489583333336 | 7.63 |
| 44706.5 | 7.62 |
| 44706.510416666664 | 7.6 |
| 44706.520833333336 | 7.6 |
| 44706.53125 | 7.59 |
| 44706.541666666664 | 7.58 |
| 44706.552083333336 | 7.58 |
| 44706.5625 | 7.56 |
| 44706.572916666664 | 7.55 |
| 44706.583333333336 | 7.56 |
| 44706.59375 | 7.57 |
| 44706.604166666664 | 7.59 |
| 44706.614583333336 | 7.62 |
| 44706.625 | 7.63 |
| 44706.635416666664 | 7.64 |
| 44706.645833333336 | 7.64 |
| 44706.65625 | 7.64 |
| 44706.666666666664 | 7.64 |
| 44706.677083333336 | 7.64 |
| 44706.6875 | 7.64 |
| 44706.697916666664 | 7.64 |
| 44706.708333333336 | 7.63 |
| 44706.71875 | 7.63 |
| 44706.729166666664 | 7.63 |
| 44706.739583333336 | 7.63 |
| 44706.75 | 7.64 |
| 44706.760416666664 | 7.64 |
| 44706.770833333336 | 7.65 |
| 44706.78125 | 7.66 |
| 44706.791666666664 | 7.67 |
| 44706.802083333336 | 7.68 |
| 44706.8125 | 7.68 |
| 44706.822916666664 | 7.69 |
| 44706.833333333336 | 7.7 |
| 44706.84375 | 7.7 |
| 44706.854166666664 | 7.71 |
| 44706.864583333336 | 7.71 |
| 44706.875 | 7.71 |
| 44706.885416666664 | 7.72 |
| 44706.895833333336 | 7.71 |
| 44706.90625 | 7.71 |
| 44706.916666666664 | 7.72 |
| 44706.927083333336 | 7.73 |
| 44706.9375 | 7.75 |
| 44706.947916666664 | 7.74 |
| 44706.958333333336 | 7.74 |
| 44706.96875 | 7.74 |
| 44706.979166666664 | 7.74 |
| 44706.989583333336 | 7.74 |
| 44707.0 | 7.74 |
| 44707.010416666664 | 7.74 |
| 44707.020833333336 | 7.74 |
| 44707.03125 | 7.74 |
| 44707.041666666664 | 7.73 |
| 44707.052083333336 | 7.73 |
| 44707.0625 | 7.72 |
| 44707.072916666664 | 7.69 |
| 44707.083333333336 | 7.68 |
| 44707.09375 | 7.66 |
| 44707.104166666664 | 7.66 |
| 44707.114583333336 | 7.68 |
| 44707.125 | 7.68 |
| 44707.135416666664 | 7.7 |
| 44707.145833333336 | 7.69 |
| 44707.15625 | 7.69 |
| 44707.166666666664 | 7.71 |
| 44707.177083333336 | 7.73 |
| 44707.1875 | 7.73 |
| 44707.197916666664 | 7.73 |
| 44707.208333333336 | 7.72 |
| 44707.21875 | 7.7 |
| 44707.229166666664 | 7.7 |
| 44707.239583333336 | 7.7 |
| 44707.25 | 7.7 |
| 44707.260416666664 | 7.7 |
| 44707.270833333336 | 7.69 |
| 44707.28125 | 7.69 |
| 44707.291666666664 | 7.68 |
| 44707.302083333336 | 7.68 |
| 44707.3125 | 7.68 |
| 44707.322916666664 | 7.68 |
| 44707.333333333336 | 7.68 |
| 44707.34375 | 7.68 |
| 44707.354166666664 | 7.68 |
| 44707.364583333336 | 7.68 |
| 44707.375 | 7.68 |
| 44707.385416666664 | 7.68 |
| 44707.395833333336 | 7.69 |
| 44707.40625 | 7.69 |
| 44707.416666666664 | 7.69 |
| 44707.427083333336 | 7.69 |
| 44707.4375 | 7.7 |
| 44707.447916666664 | 7.71 |
| 44707.458333333336 | 7.69 |
| 44707.46875 | 7.68 |
| 44707.479166666664 | 7.67 |
| 44707.489583333336 | 7.67 |
| 44707.5 | 7.68 |
| 44707.510416666664 | 7.67 |
| 44707.520833333336 | 7.66 |
| 44707.53125 | 7.65 |
| 44707.541666666664 | 7.64 |
| 44707.552083333336 | 7.62 |
| 44707.5625 | 7.61 |
| 44707.572916666664 | 7.61 |
| 44707.583333333336 | 7.61 |
| 44707.59375 | 7.62 |
| 44707.604166666664 | 7.62 |
| 44707.614583333336 | 7.63 |
| 44707.625 | 7.64 |
| 44707.635416666664 | 7.62 |
| 44707.645833333336 | 7.65 |
| 44707.65625 | 7.65 |
| 44707.666666666664 | 7.66 |
| 44707.677083333336 | 7.68 |
| 44707.6875 | 7.68 |
| 44707.697916666664 | 7.68 |
| 44707.708333333336 | 7.68 |
| 44707.71875 | 7.68 |
| 44707.729166666664 | 7.67 |
| 44707.739583333336 | 7.66 |
| 44707.75 | 7.66 |
| 44707.760416666664 | 7.66 |
| 44707.770833333336 | 7.66 |
| 44707.78125 | 7.66 |
| 44707.791666666664 | 7.66 |
| 44707.802083333336 | 7.66 |
| 44707.8125 | 7.66 |
| 44707.822916666664 | 7.66 |
| 44707.833333333336 | 7.66 |
| 44707.84375 | 7.66 |
| 44707.854166666664 | 7.66 |
| 44707.864583333336 | 7.66 |
| 44707.875 | 7.66 |
| 44707.885416666664 | 7.66 |
| 44707.895833333336 | 7.67 |
| 44707.90625 | 7.67 |
| 44707.916666666664 | 7.68 |
| 44707.927083333336 | 7.68 |
| 44707.9375 | 7.68 |
| 44707.947916666664 | 7.69 |
| 44707.958333333336 | 7.69 |
| 44707.96875 | 7.68 |
| 44707.979166666664 | 7.69 |
| 44707.989583333336 | 7.68 |
| 44708.0 | 7.67 |
| 44708.010416666664 | 7.67 |
| 44708.020833333336 | 7.67 |
| 44708.03125 | 7.67 |
| 44708.041666666664 | 7.67 |
| 44708.052083333336 | 7.67 |
| 44708.0625 | 7.65 |
| 44708.072916666664 | 7.64 |
| 44708.083333333336 | 7.62 |
| 44708.09375 | 7.59 |
| 44708.104166666664 | 7.58 |
| 44708.114583333336 | 7.57 |
| 44708.125 | 7.55 |
| 44708.135416666664 | 7.56 |
| 44708.145833333336 | 7.58 |
| 44708.15625 | 7.63 |
| 44708.166666666664 | 7.64 |
| 44708.177083333336 | 7.65 |
| 44708.1875 | 7.66 |
| 44708.197916666664 | 7.65 |
| 44708.208333333336 | 7.65 |
| 44708.21875 | 7.65 |
| 44708.229166666664 | 7.65 |
| 44708.239583333336 | 7.64 |
| 44708.25 | 7.63 |
| 44708.260416666664 | 7.62 |
| 44708.270833333336 | 7.62 |
| 44708.28125 | 7.62 |
| 44708.291666666664 | 7.62 |
| 44708.302083333336 | 7.61 |
| 44708.3125 | 7.6 |
| 44708.322916666664 | 7.6 |
| 44708.333333333336 | 7.6 |
| 44708.34375 | 7.59 |
| 44708.354166666664 | 7.59 |
| 44708.364583333336 | 7.59 |
| 44708.375 | 7.59 |
| 44708.385416666664 | 7.58 |
| 44708.395833333336 | 7.58 |
| 44708.40625 | 7.58 |
| 44708.416666666664 | 7.58 |
| 44708.427083333336 | 7.58 |
| 44708.4375 | 7.59 |
| 44708.447916666664 | 7.59 |
| 44708.458333333336 | 7.59 |
| 44708.46875 | 7.6 |
| 44708.479166666664 | 7.59 |
| 44708.489583333336 | 7.59 |
| 44708.5 | 7.58 |
| 44708.510416666664 | 7.58 |
| 44708.520833333336 | 7.58 |
| 44708.53125 | 7.56 |
| 44708.541666666664 | 7.56 |
| 44708.552083333336 | 7.55 |
| 44708.5625 | 7.57 |
| 44708.572916666664 | 7.56 |
| 44708.583333333336 | 7.54 |
| 44708.59375 | 7.54 |
| 44708.604166666664 | 7.54 |
| 44708.614583333336 | 7.55 |
| 44708.625 | 7.56 |
| 44708.635416666664 | 7.57 |
| 44708.645833333336 | 7.6 |
| 44708.65625 | 7.6 |
| 44708.666666666664 | 7.61 |
| 44708.677083333336 | 7.63 |
| 44708.6875 | 7.63 |
| 44708.697916666664 | 7.64 |
| 44708.708333333336 | 7.64 |
| 44708.71875 | 7.64 |
| 44708.729166666664 | 7.62 |
| 44708.739583333336 | 7.62 |
| 44708.75 | 7.61 |
| 44708.760416666664 | 7.6 |
| 44708.770833333336 | 7.6 |
| 44708.78125 | 7.6 |
| 44708.791666666664 | 7.59 |
| 44708.802083333336 | 7.59 |
| 44708.8125 | 7.59 |
| 44708.822916666664 | 7.59 |
| 44708.833333333336 | 7.59 |
| 44708.84375 | 7.59 |
| 44708.854166666664 | 7.59 |
| 44708.864583333336 | 7.59 |
| 44708.875 | 7.59 |
| 44708.885416666664 | 7.59 |
| 44708.895833333336 | 7.6 |
| 44708.90625 | 7.6 |
| 44708.916666666664 | 7.6 |
| 44708.927083333336 | 7.6 |
| 44708.9375 | 7.61 |
| 44708.947916666664 | 7.61 |
| 44708.958333333336 | 7.62 |
| 44708.96875 | 7.62 |
| 44708.979166666664 | 7.62 |
| 44708.989583333336 | 7.62 |
| 44709.0 | 7.62 |
| 44709.010416666664 | 7.61 |
| 44709.020833333336 | 7.6 |
| 44709.03125 | 7.59 |
| 44709.041666666664 | 7.6 |
| 44709.052083333336 | 7.6 |
| 44709.0625 | 7.6 |
| 44709.072916666664 | 7.59 |
| 44709.083333333336 | 7.57 |
| 44709.09375 | 7.56 |
| 44709.104166666664 | 7.55 |
| 44709.114583333336 | 7.53 |
| 44709.125 | 7.53 |
| 44709.135416666664 | 7.52 |
| 44709.145833333336 | 7.5 |
| 44709.15625 | 7.5 |
| 44709.166666666664 | 7.5 |
| 44709.177083333336 | 7.49 |
| 44709.1875 | 7.53 |
| 44709.197916666664 | 7.55 |
| 44709.208333333336 | 7.55 |
| 44709.21875 | 7.57 |
| 44709.229166666664 | 7.58 |
| 44709.239583333336 | 7.58 |
| 44709.25 | 7.58 |
| 44709.260416666664 | 7.58 |
| 44709.270833333336 | 7.57 |
| 44709.28125 | 7.57 |
| 44709.291666666664 | 7.56 |
| 44709.302083333336 | 7.55 |
| 44709.3125 | 7.55 |
| 44709.322916666664 | 7.54 |
| 44709.333333333336 | 7.54 |
| 44709.34375 | 7.53 |
| 44709.354166666664 | 7.53 |
| 44709.364583333336 | 7.53 |
| 44709.375 | 7.53 |
| 44709.385416666664 | 7.53 |
| 44709.395833333336 | 7.53 |
| 44709.40625 | 7.53 |
| 44709.416666666664 | 7.52 |
| 44709.427083333336 | 7.52 |
| 44709.4375 | 7.52 |
| 44709.447916666664 | 7.52 |
| 44709.458333333336 | 7.52 |
| 44709.46875 | 7.52 |
| 44709.479166666664 | 7.53 |
| 44709.489583333336 | 7.54 |
| 44709.5 | 7.54 |
| 44709.510416666664 | 7.54 |
| 44709.520833333336 | 7.55 |
| 44709.53125 | 7.54 |
| 44709.541666666664 | 7.54 |
| 44709.552083333336 | 7.54 |
| 44709.5625 | 7.54 |
| 44709.572916666664 | 7.54 |
| 44709.583333333336 | 7.54 |
| 44709.59375 | 7.55 |
| 44709.604166666664 | 7.55 |
| 44709.614583333336 | 7.55 |
| 44709.625 | 7.55 |
| 44709.635416666664 | 7.56 |
| 44709.645833333336 | 7.58 |
| 44709.65625 | 7.59 |
| 44709.666666666664 | 7.6 |
| 44709.677083333336 | 7.61 |
| 44709.6875 | 7.61 |
| 44709.697916666664 | 7.62 |
| 44709.708333333336 | 7.63 |
| 44709.71875 | 7.64 |
| 44709.729166666664 | 7.66 |
| 44709.739583333336 | 7.68 |
| 44709.75 | 7.69 |
| 44709.760416666664 | 7.69 |
| 44709.770833333336 | 7.68 |
| 44709.78125 | 7.64 |
| 44709.791666666664 | 7.62 |
| 44709.802083333336 | 7.62 |
| 44709.8125 | 7.6 |
| 44709.822916666664 | 7.58 |
| 44709.833333333336 | 7.58 |
| 44709.84375 | 7.57 |
| 44709.854166666664 | 7.57 |
| 44709.864583333336 | 7.56 |
| 44709.875 | 7.55 |
| 44709.885416666664 | 7.55 |
| 44709.895833333336 | 7.55 |
| 44709.90625 | 7.54 |
| 44709.916666666664 | 7.54 |
| 44709.927083333336 | 7.55 |
| 44709.9375 | 7.56 |
| 44709.947916666664 | 7.57 |
| 44709.958333333336 | 7.57 |
| 44709.96875 | 7.58 |
| 44709.979166666664 | 7.58 |
| 44709.989583333336 | 7.58 |
| 44710.0 | 7.58 |
| 44710.010416666664 | 7.58 |
| 44710.020833333336 | 7.58 |
| 44710.03125 | 7.58 |
| 44710.041666666664 | 7.57 |
| 44710.052083333336 | 7.56 |
| 44710.0625 | 7.56 |
| 44710.072916666664 | 7.56 |
| 44710.083333333336 | 7.55 |
| 44710.09375 | 7.55 |
| 44710.104166666664 | 7.54 |
| 44710.114583333336 | 7.54 |
| 44710.125 | 7.51 |
| 44710.135416666664 | 7.49 |
| 44710.145833333336 | 7.45 |
| 44710.15625 | 7.41 |
| 44710.166666666664 | 7.42 |
| 44710.177083333336 | 7.48 |
| 44710.1875 | 7.54 |
| 44710.197916666664 | 7.55 |
| 44710.208333333336 | 7.58 |
| 44710.21875 | 7.58 |
| 44710.229166666664 | 7.59 |
| 44710.239583333336 | 7.6 |
| 44710.25 | 7.59 |
| 44710.260416666664 | 7.6 |
| 44710.270833333336 | 7.58 |
| 44710.28125 | 7.58 |
| 44710.291666666664 | 7.57 |
| 44710.302083333336 | 7.57 |
| 44710.3125 | 7.57 |
| 44710.322916666664 | 7.56 |
| 44710.333333333336 | 7.55 |
| 44710.34375 | 7.55 |
| 44710.354166666664 | 7.54 |
| 44710.364583333336 | 7.52 |
| 44710.375 | 7.5 |
| 44710.385416666664 | 7.48 |
| 44710.395833333336 | 7.48 |
| 44710.40625 | 7.48 |
| 44710.416666666664 | 7.47 |
| 44710.427083333336 | 7.46 |
| 44710.4375 | 7.46 |
| 44710.447916666664 | 7.46 |
| 44710.458333333336 | 7.46 |
| 44710.46875 | 7.46 |
| 44710.479166666664 | 7.46 |
| 44710.489583333336 | 7.47 |
| 44710.5 | 7.48 |
| 44710.510416666664 | 7.48 |
| 44710.520833333336 | 7.48 |
| 44710.53125 | 7.49 |
| 44710.541666666664 | 7.5 |
| 44710.552083333336 | 7.51 |
| 44710.5625 | 7.5 |
| 44710.572916666664 | 7.5 |
| 44710.583333333336 | 7.51 |
| 44710.59375 | 7.51 |
| 44710.604166666664 | 7.51 |
| 44710.614583333336 | 7.52 |
| 44710.625 | 7.54 |
| 44710.635416666664 | 7.54 |
| 44710.645833333336 | 7.55 |
| 44710.65625 | 7.56 |
| 44710.666666666664 | 7.59 |
| 44710.677083333336 | 7.62 |
| 44710.6875 | 7.64 |
| 44710.697916666664 | 7.65 |
| 44710.708333333336 | 7.68 |
| 44710.71875 | 7.7 |
| 44710.729166666664 | 7.71 |
| 44710.739583333336 | 7.73 |
| 44710.75 | 7.76 |
| 44710.760416666664 | 7.77 |
| 44710.770833333336 | 7.79 |
| 44710.78125 | 7.8 |
| 44710.791666666664 | 7.8 |
| 44710.802083333336 | 7.79 |
| 44710.8125 | 7.76 |
| 44710.822916666664 | 7.74 |
| 44710.833333333336 | 7.7 |
| 44710.84375 | 7.67 |
| 44710.854166666664 | 7.64 |
| 44710.864583333336 | 7.62 |
| 44710.875 | 7.59 |
| 44710.885416666664 | 7.57 |
| 44710.895833333336 | 7.56 |
| 44710.90625 | 7.54 |
| 44710.916666666664 | 7.53 |
| 44710.927083333336 | 7.52 |
| 44710.9375 | 7.52 |
| 44710.947916666664 | 7.52 |
| 44710.958333333336 | 7.52 |
| 44710.96875 | 7.52 |
| 44710.979166666664 | 7.53 |
| 44710.989583333336 | 7.53 |
| 44711.0 | 7.53 |
| 44711.010416666664 | 7.53 |
| 44711.020833333336 | 7.53 |
| 44711.03125 | 7.53 |
| 44711.041666666664 | 7.53 |
| 44711.052083333336 | 7.53 |
| 44711.0625 | 7.52 |
| 44711.072916666664 | 7.51 |
| 44711.083333333336 | 7.51 |
| 44711.09375 | 7.52 |
| 44711.104166666664 | 7.5 |
| 44711.114583333336 | 7.5 |
| 44711.125 | 7.48 |
| 44711.135416666664 | 7.47 |
| 44711.145833333336 | 7.46 |
| 44711.15625 | 7.44 |
| 44711.166666666664 | 7.42 |
| 44711.177083333336 | 7.39 |
| 44711.1875 | 7.37 |
| 44711.197916666664 | 7.37 |
| 44711.208333333336 | 7.43 |
| 44711.21875 | 7.48 |
| 44711.229166666664 | 7.52 |
| 44711.239583333336 | 7.55 |
| 44711.25 | 7.56 |
| 44711.260416666664 | 7.57 |
| 44711.270833333336 | 7.58 |
| 44711.28125 | 7.58 |
| 44711.291666666664 | 7.59 |
| 44711.302083333336 | 7.59 |
| 44711.3125 | 7.58 |
| 44711.322916666664 | 7.58 |
| 44711.333333333336 | 7.56 |
| 44711.34375 | 7.55 |
| 44711.354166666664 | 7.54 |
| 44711.364583333336 | 7.54 |
| 44711.375 | 7.53 |
| 44711.385416666664 | 7.51 |
| 44711.395833333336 | 7.48 |
| 44711.40625 | 7.46 |
| 44711.416666666664 | 7.45 |
| 44711.427083333336 | 7.44 |
| 44711.4375 | 7.44 |
| 44711.447916666664 | 7.43 |
| 44711.458333333336 | 7.43 |
| 44711.46875 | 7.42 |
| 44711.479166666664 | 7.41 |
| 44711.489583333336 | 7.41 |
| 44711.5 | 7.41 |
| 44711.510416666664 | 7.41 |
| 44711.520833333336 | 7.41 |
| 44711.53125 | 7.41 |
| 44711.541666666664 | 7.42 |
| 44711.552083333336 | 7.42 |
| 44711.5625 | 7.43 |
| 44711.572916666664 | 7.43 |
| 44711.583333333336 | 7.43 |
| 44711.59375 | 7.43 |
| 44711.604166666664 | 7.45 |
| 44711.614583333336 | 7.48 |
| 44711.625 | 7.51 |
| 44711.635416666664 | 7.52 |
| 44711.645833333336 | 7.54 |
| 44711.65625 | 7.56 |
| 44711.666666666664 | 7.56 |
| 44711.677083333336 | 7.56 |
| 44711.6875 | 7.57 |
| 44711.697916666664 | 7.6 |
| 44711.708333333336 | 7.64 |
| 44711.71875 | 7.68 |
| 44711.729166666664 | 7.7 |
| 44711.739583333336 | 7.74 |
| 44711.75 | 7.75 |
| 44711.760416666664 | 7.78 |
| 44711.770833333336 | 7.81 |
| 44711.78125 | 7.83 |
| 44711.791666666664 | 7.86 |
| 44711.802083333336 | 7.88 |
| 44711.8125 | 7.9 |
| 44711.822916666664 | 7.86 |
| 44711.833333333336 | 7.83 |
| 44711.84375 | 7.83 |
| 44711.854166666664 | 7.78 |
| 44711.864583333336 | 7.73 |
| 44711.875 | 7.69 |
| 44711.885416666664 | 7.64 |
| 44711.895833333336 | 7.59 |
| 44711.90625 | 7.57 |
| 44711.916666666664 | 7.55 |
| 44711.927083333336 | 7.54 |
| 44711.9375 | 7.53 |
| 44711.947916666664 | 7.52 |
| 44711.958333333336 | 7.52 |
| 44711.96875 | 7.52 |
| 44711.979166666664 | 7.52 |
| 44711.989583333336 | 7.52 |
| 44712.0 | 7.52 |
| 44712.010416666664 | 7.53 |
| 44712.020833333336 | 7.53 |
| 44712.03125 | 7.53 |
| 44712.041666666664 | 7.53 |
| 44712.052083333336 | 7.53 |
| 44712.0625 | 7.52 |
| 44712.072916666664 | 7.52 |
| 44712.083333333336 | 7.51 |
| 44712.09375 | 7.5 |
| 44712.104166666664 | 7.5 |
| 44712.114583333336 | 7.51 |
| 44712.125 | 7.5 |
| 44712.135416666664 | 7.5 |
| 44712.145833333336 | 7.49 |
| 44712.15625 | 7.48 |
| 44712.166666666664 | 7.47 |
| 44712.177083333336 | 7.43 |
| 44712.1875 | 7.4 |
| 44712.197916666664 | 7.41 |
| 44712.208333333336 | 7.43 |
| 44712.21875 | 7.44 |
| 44712.229166666664 | 7.51 |
| 44712.239583333336 | 7.53 |
| 44712.25 | 7.56 |
| 44712.260416666664 | 7.58 |
| 44712.270833333336 | 7.61 |
| 44712.28125 | 7.61 |
| 44712.291666666664 | 7.62 |
| 44712.302083333336 | 7.63 |
| 44712.3125 | 7.64 |
| 44712.322916666664 | 7.63 |
| 44712.333333333336 | 7.63 |
| 44712.34375 | 7.63 |
| 44712.354166666664 | 7.62 |
| 44712.364583333336 | 7.6 |
| 44712.375 | 7.59 |
| 44712.385416666664 | 7.59 |
| 44712.395833333336 | 7.57 |
| 44712.40625 | 7.56 |
| 44712.416666666664 | 7.54 |
| 44712.427083333336 | 7.5 |
| 44712.4375 | 7.48 |
| 44712.447916666664 | 7.47 |
| 44712.458333333336 | 7.46 |
| 44712.46875 | 7.45 |
| 44712.479166666664 | 7.44 |
| 44712.489583333336 | 7.43 |
| 44712.5 | 7.42 |
| 44712.510416666664 | 7.42 |
| 44712.520833333336 | 7.41 |
| 44712.53125 | 7.41 |
| 44712.541666666664 | 7.41 |
| 44712.552083333336 | 7.41 |
| 44712.5625 | 7.41 |
| 44712.572916666664 | 7.42 |
| 44712.583333333336 | 7.41 |
| 44712.59375 | 7.41 |
| 44712.604166666664 | 7.43 |
| 44712.614583333336 | 7.44 |
| 44712.625 | 7.44 |
| 44712.635416666664 | 7.45 |
| 44712.645833333336 | 7.5 |
| 44712.65625 | 7.51 |
| 44712.666666666664 | 7.53 |
| 44712.677083333336 | 7.53 |
| 44712.6875 | 7.55 |
| 44712.697916666664 | 7.54 |
| 44712.708333333336 | 7.57 |
| 44712.71875 | 7.61 |
| 44712.729166666664 | 7.71 |
| 44712.739583333336 | 7.77 |
| 44712.75 | 7.8 |
| 44712.760416666664 | 7.85 |
| 44712.770833333336 | 7.88 |
| 44712.78125 | 7.92 |
| 44712.791666666664 | 7.94 |
| 44712.802083333336 | 7.96 |
| 44712.8125 | 7.97 |
| 44712.822916666664 | 7.95 |
| 44712.833333333336 | 7.97 |
| 44712.84375 | 8 |
| 44712.854166666664 | 7.92 |
| 44712.864583333336 | 7.87 |
| 44712.875 | 7.87 |
| 44712.885416666664 | 7.84 |
| 44712.895833333336 | 7.85 |
| 44712.90625 | 7.83 |
| 44712.916666666664 | 7.76 |
| 44712.927083333336 | 7.67 |
| 44712.9375 | 7.63 |
| 44712.947916666664 | 7.61 |
| 44712.958333333336 | 7.56 |
| 44712.96875 | 7.53 |
| 44712.979166666664 | 7.51 |
| 44712.989583333336 | 7.49 |
| 44713.0 | 7.48 |
| 44713.010416666664 | 7.48 |
| 44713.020833333336 | 7.48 |
| 44713.03125 | 7.49 |
| 44713.041666666664 | 7.5 |
| 44713.052083333336 | 7.51 |
| 44713.0625 | 7.51 |
| 44713.072916666664 | 7.51 |
| 44713.083333333336 | 7.51 |
| 44713.09375 | 7.51 |
| 44713.104166666664 | 7.51 |
| 44713.114583333336 | 7.49 |
| 44713.125 | 7.51 |
| 44713.135416666664 | 7.5 |
| 44713.145833333336 | 7.5 |
| 44713.15625 | 7.48 |